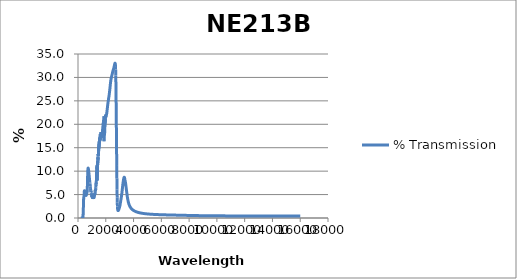
| Category | % Transmission |
|---|---|
| 200.0 | 0 |
| 201.0 | 0 |
| 202.0 | 0 |
| 203.0 | 0 |
| 204.0 | 0 |
| 205.0 | 0 |
| 206.0 | 0 |
| 207.0 | 0 |
| 208.0 | 0 |
| 209.0 | 0 |
| 210.0 | 0 |
| 211.0 | 0 |
| 212.0 | 0 |
| 213.0 | 0 |
| 214.0 | 0 |
| 215.0 | 0 |
| 216.0 | 0 |
| 217.0 | 0 |
| 218.0 | 0 |
| 219.0 | 0 |
| 220.0 | 0 |
| 221.0 | 0 |
| 222.0 | 0 |
| 223.0 | 0 |
| 224.0 | 0 |
| 225.0 | 0 |
| 226.0 | 0 |
| 227.0 | 0 |
| 228.0 | 0 |
| 229.0 | 0 |
| 230.0 | 0 |
| 231.0 | 0 |
| 232.0 | 0 |
| 233.0 | 0 |
| 234.0 | 0 |
| 235.0 | 0 |
| 236.0 | 0 |
| 237.0 | 0 |
| 238.0 | 0 |
| 239.0 | 0 |
| 240.0 | 0 |
| 241.0 | 0 |
| 242.0 | 0 |
| 243.0 | 0 |
| 244.0 | 0 |
| 245.0 | 0 |
| 246.0 | 0 |
| 247.0 | 0 |
| 248.0 | 0 |
| 249.0 | 0 |
| 250.0 | 0 |
| 251.0 | 0 |
| 252.0 | 0 |
| 253.0 | 0 |
| 254.0 | 0 |
| 255.0 | 0 |
| 256.0 | 0 |
| 257.0 | 0 |
| 258.0 | 0 |
| 259.0 | 0 |
| 260.0 | 0 |
| 261.0 | 0 |
| 262.0 | 0 |
| 263.0 | 0 |
| 264.0 | 0 |
| 265.0 | 0 |
| 266.0 | 0 |
| 267.0 | 0 |
| 268.0 | 0 |
| 269.0 | 0 |
| 270.0 | 0 |
| 271.0 | 0 |
| 272.0 | 0 |
| 273.0 | 0 |
| 274.0 | 0 |
| 275.0 | 0 |
| 276.0 | 0 |
| 277.0 | 0 |
| 278.0 | 0 |
| 279.0 | 0 |
| 280.0 | 0 |
| 281.0 | 0 |
| 282.0 | 0 |
| 283.0 | 0 |
| 284.0 | 0 |
| 285.0 | 0 |
| 286.0 | 0 |
| 287.0 | 0 |
| 288.0 | 0 |
| 289.0 | 0 |
| 290.0 | 0 |
| 291.0 | 0 |
| 292.0 | 0 |
| 293.0 | 0 |
| 294.0 | 0 |
| 295.0 | 0 |
| 296.0 | 0 |
| 297.0 | 0 |
| 298.0 | 0 |
| 299.0 | 0 |
| 300.0 | 0 |
| 301.0 | 0 |
| 302.0 | 0 |
| 303.0 | 0 |
| 304.0 | 0 |
| 305.0 | 0 |
| 306.0 | 0 |
| 307.0 | 0 |
| 308.0 | 0 |
| 309.0 | 0 |
| 310.0 | 0 |
| 311.0 | 0 |
| 312.0 | 0 |
| 313.0 | 0 |
| 314.0 | 0 |
| 315.0 | 0 |
| 316.0 | 0 |
| 317.0 | 0 |
| 318.0 | 0 |
| 319.0 | 0 |
| 320.0 | 0 |
| 321.0 | 0 |
| 322.0 | 0 |
| 323.0 | 0 |
| 324.0 | 0 |
| 325.0 | 0 |
| 326.0 | 0 |
| 327.0 | 0 |
| 328.0 | 0 |
| 329.0 | 0 |
| 330.0 | 0 |
| 331.0 | 0 |
| 332.0 | 0 |
| 333.0 | 0 |
| 334.0 | 0 |
| 335.0 | 0 |
| 336.0 | 0 |
| 337.0 | 0 |
| 338.0 | 0 |
| 339.0 | 0.001 |
| 340.0 | 0.001 |
| 341.0 | 0.002 |
| 342.0 | 0.003 |
| 343.0 | 0.004 |
| 344.0 | 0.006 |
| 345.0 | 0.009 |
| 346.0 | 0.013 |
| 347.0 | 0.018 |
| 348.0 | 0.024 |
| 349.0 | 0.033 |
| 350.0 | 0.043 |
| 351.0 | 0.056 |
| 352.0 | 0.071 |
| 353.0 | 0.09 |
| 354.0 | 0.112 |
| 355.0 | 0.138 |
| 356.0 | 0.168 |
| 357.0 | 0.203 |
| 358.0 | 0.243 |
| 359.0 | 0.288 |
| 360.0 | 0.338 |
| 361.0 | 0.392 |
| 362.0 | 0.448 |
| 363.0 | 0.507 |
| 364.0 | 0.567 |
| 365.0 | 0.63 |
| 366.0 | 0.691 |
| 367.0 | 0.748 |
| 368.0 | 0.793 |
| 369.0 | 0.824 |
| 370.0 | 0.836 |
| 371.0 | 0.832 |
| 372.0 | 0.813 |
| 373.0 | 0.785 |
| 374.0 | 0.756 |
| 375.0 | 0.736 |
| 376.0 | 0.735 |
| 377.0 | 0.759 |
| 378.0 | 0.811 |
| 379.0 | 0.891 |
| 380.0 | 0.999 |
| 381.0 | 1.129 |
| 382.0 | 1.278 |
| 383.0 | 1.441 |
| 384.0 | 1.615 |
| 385.0 | 1.797 |
| 386.0 | 1.985 |
| 387.0 | 2.177 |
| 388.0 | 2.368 |
| 389.0 | 2.551 |
| 390.0 | 2.724 |
| 391.0 | 2.887 |
| 392.0 | 3.044 |
| 393.0 | 3.195 |
| 394.0 | 3.336 |
| 395.0 | 3.462 |
| 396.0 | 3.575 |
| 397.0 | 3.679 |
| 398.0 | 3.774 |
| 399.0 | 3.857 |
| 400.0 | 3.925 |
| 401.0 | 3.977 |
| 402.0 | 4.013 |
| 403.0 | 4.036 |
| 404.0 | 4.05 |
| 405.0 | 4.062 |
| 406.0 | 4.069 |
| 407.0 | 4.07 |
| 408.0 | 4.065 |
| 409.0 | 4.061 |
| 410.0 | 4.065 |
| 411.0 | 4.078 |
| 412.0 | 4.095 |
| 413.0 | 4.113 |
| 414.0 | 4.13 |
| 415.0 | 4.152 |
| 416.0 | 4.184 |
| 417.0 | 4.226 |
| 418.0 | 4.27 |
| 419.0 | 4.314 |
| 420.0 | 4.356 |
| 421.0 | 4.399 |
| 422.0 | 4.449 |
| 423.0 | 4.504 |
| 424.0 | 4.556 |
| 425.0 | 4.599 |
| 426.0 | 4.632 |
| 427.0 | 4.661 |
| 428.0 | 4.691 |
| 429.0 | 4.719 |
| 430.0 | 4.738 |
| 431.0 | 4.744 |
| 432.0 | 4.737 |
| 433.0 | 4.725 |
| 434.0 | 4.715 |
| 435.0 | 4.707 |
| 436.0 | 4.699 |
| 437.0 | 4.689 |
| 438.0 | 4.681 |
| 439.0 | 4.683 |
| 440.0 | 4.7 |
| 441.0 | 4.732 |
| 442.0 | 4.773 |
| 443.0 | 4.818 |
| 444.0 | 4.869 |
| 445.0 | 4.928 |
| 446.0 | 4.999 |
| 447.0 | 5.078 |
| 448.0 | 5.157 |
| 449.0 | 5.23 |
| 450.0 | 5.295 |
| 451.0 | 5.359 |
| 452.0 | 5.426 |
| 453.0 | 5.494 |
| 454.0 | 5.557 |
| 455.0 | 5.61 |
| 456.0 | 5.655 |
| 457.0 | 5.696 |
| 458.0 | 5.738 |
| 459.0 | 5.777 |
| 460.0 | 5.806 |
| 461.0 | 5.82 |
| 462.0 | 5.82 |
| 463.0 | 5.817 |
| 464.0 | 5.816 |
| 465.0 | 5.815 |
| 466.0 | 5.807 |
| 467.0 | 5.789 |
| 468.0 | 5.763 |
| 469.0 | 5.736 |
| 470.0 | 5.713 |
| 471.0 | 5.693 |
| 472.0 | 5.67 |
| 473.0 | 5.642 |
| 474.0 | 5.612 |
| 475.0 | 5.584 |
| 476.0 | 5.562 |
| 477.0 | 5.541 |
| 478.0 | 5.515 |
| 479.0 | 5.48 |
| 480.0 | 5.441 |
| 481.0 | 5.408 |
| 482.0 | 5.384 |
| 483.0 | 5.366 |
| 484.0 | 5.347 |
| 485.0 | 5.324 |
| 486.0 | 5.297 |
| 487.0 | 5.27 |
| 488.0 | 5.244 |
| 489.0 | 5.221 |
| 490.0 | 5.199 |
| 491.0 | 5.178 |
| 492.0 | 5.156 |
| 493.0 | 5.14 |
| 494.0 | 5.131 |
| 495.0 | 5.125 |
| 496.0 | 5.115 |
| 497.0 | 5.099 |
| 498.0 | 5.08 |
| 499.0 | 5.064 |
| 500.0 | 5.055 |
| 501.0 | 5.052 |
| 502.0 | 5.048 |
| 503.0 | 5.04 |
| 504.0 | 5.029 |
| 505.0 | 5.023 |
| 506.0 | 5.024 |
| 507.0 | 5.032 |
| 508.0 | 5.04 |
| 509.0 | 5.044 |
| 510.0 | 5.044 |
| 511.0 | 5.045 |
| 512.0 | 5.052 |
| 513.0 | 5.065 |
| 514.0 | 5.079 |
| 515.0 | 5.089 |
| 516.0 | 5.097 |
| 517.0 | 5.109 |
| 518.0 | 5.129 |
| 519.0 | 5.154 |
| 520.0 | 5.178 |
| 521.0 | 5.197 |
| 522.0 | 5.212 |
| 523.0 | 5.233 |
| 524.0 | 5.26 |
| 525.0 | 5.289 |
| 526.0 | 5.316 |
| 527.0 | 5.339 |
| 528.0 | 5.365 |
| 529.0 | 5.395 |
| 530.0 | 5.431 |
| 531.0 | 5.468 |
| 532.0 | 5.501 |
| 533.0 | 5.53 |
| 534.0 | 5.554 |
| 535.0 | 5.576 |
| 536.0 | 5.6 |
| 537.0 | 5.623 |
| 538.0 | 5.646 |
| 539.0 | 5.668 |
| 540.0 | 5.685 |
| 541.0 | 5.698 |
| 542.0 | 5.71 |
| 543.0 | 5.723 |
| 544.0 | 5.739 |
| 545.0 | 5.752 |
| 546.0 | 5.76 |
| 547.0 | 5.761 |
| 548.0 | 5.758 |
| 549.0 | 5.757 |
| 550.0 | 5.759 |
| 551.0 | 5.759 |
| 552.0 | 5.752 |
| 553.0 | 5.734 |
| 554.0 | 5.713 |
| 555.0 | 5.696 |
| 556.0 | 5.684 |
| 557.0 | 5.667 |
| 558.0 | 5.645 |
| 559.0 | 5.618 |
| 560.0 | 5.594 |
| 561.0 | 5.57 |
| 562.0 | 5.544 |
| 563.0 | 5.516 |
| 564.0 | 5.487 |
| 565.0 | 5.459 |
| 566.0 | 5.429 |
| 567.0 | 5.396 |
| 568.0 | 5.362 |
| 569.0 | 5.329 |
| 570.0 | 5.297 |
| 571.0 | 5.264 |
| 572.0 | 5.228 |
| 573.0 | 5.191 |
| 574.0 | 5.157 |
| 575.0 | 5.125 |
| 576.0 | 5.093 |
| 577.0 | 5.058 |
| 578.0 | 5.024 |
| 579.0 | 4.993 |
| 580.0 | 4.967 |
| 581.0 | 4.942 |
| 582.0 | 4.916 |
| 583.0 | 4.892 |
| 584.0 | 4.872 |
| 585.0 | 4.857 |
| 586.0 | 4.846 |
| 587.0 | 4.838 |
| 588.0 | 4.83 |
| 589.0 | 4.822 |
| 590.0 | 4.818 |
| 591.0 | 4.818 |
| 592.0 | 4.821 |
| 593.0 | 4.823 |
| 594.0 | 4.825 |
| 595.0 | 4.833 |
| 596.0 | 4.848 |
| 597.0 | 4.866 |
| 598.0 | 4.885 |
| 599.0 | 4.901 |
| 600.0 | 4.916 |
| 601.0 | 4.928 |
| 602.0 | 4.942 |
| 603.0 | 4.959 |
| 604.0 | 4.98 |
| 605.0 | 5.002 |
| 606.0 | 5.023 |
| 607.0 | 5.042 |
| 608.0 | 5.06 |
| 609.0 | 5.078 |
| 610.0 | 5.101 |
| 611.0 | 5.124 |
| 612.0 | 5.148 |
| 613.0 | 5.169 |
| 614.0 | 5.188 |
| 615.0 | 5.207 |
| 616.0 | 5.229 |
| 617.0 | 5.249 |
| 618.0 | 5.265 |
| 619.0 | 5.277 |
| 620.0 | 5.286 |
| 621.0 | 5.296 |
| 622.0 | 5.309 |
| 623.0 | 5.325 |
| 624.0 | 5.341 |
| 625.0 | 5.352 |
| 626.0 | 5.354 |
| 627.0 | 5.354 |
| 628.0 | 5.353 |
| 629.0 | 5.357 |
| 630.0 | 5.36 |
| 631.0 | 5.36 |
| 632.0 | 5.353 |
| 633.0 | 5.344 |
| 634.0 | 5.339 |
| 635.0 | 5.34 |
| 636.0 | 5.341 |
| 637.0 | 5.336 |
| 638.0 | 5.332 |
| 639.0 | 5.329 |
| 640.0 | 5.332 |
| 641.0 | 5.337 |
| 642.0 | 5.343 |
| 643.0 | 5.347 |
| 644.0 | 5.351 |
| 645.0 | 5.355 |
| 646.0 | 5.36 |
| 647.0 | 5.367 |
| 648.0 | 5.376 |
| 649.0 | 5.388 |
| 650.0 | 5.402 |
| 651.0 | 5.414 |
| 652.0 | 5.427 |
| 653.0 | 5.448 |
| 654.0 | 5.476 |
| 655.0 | 5.504 |
| 656.0 | 5.526 |
| 657.0 | 5.55 |
| 658.0 | 5.584 |
| 659.0 | 5.628 |
| 660.0 | 5.677 |
| 661.0 | 5.725 |
| 662.0 | 5.77 |
| 663.0 | 5.818 |
| 664.0 | 5.875 |
| 665.0 | 5.937 |
| 666.0 | 6.006 |
| 667.0 | 6.073 |
| 668.0 | 6.146 |
| 669.0 | 6.219 |
| 670.0 | 6.302 |
| 671.0 | 6.389 |
| 672.0 | 6.483 |
| 673.0 | 6.577 |
| 674.0 | 6.675 |
| 675.0 | 6.778 |
| 676.0 | 6.888 |
| 677.0 | 7.006 |
| 678.0 | 7.128 |
| 679.0 | 7.246 |
| 680.0 | 7.358 |
| 681.0 | 7.468 |
| 682.0 | 7.589 |
| 683.0 | 7.713 |
| 684.0 | 7.842 |
| 685.0 | 7.962 |
| 686.0 | 8.085 |
| 687.0 | 8.205 |
| 688.0 | 8.334 |
| 689.0 | 8.463 |
| 690.0 | 8.588 |
| 691.0 | 8.703 |
| 692.0 | 8.811 |
| 693.0 | 8.915 |
| 694.0 | 9.017 |
| 695.0 | 9.115 |
| 696.0 | 9.211 |
| 697.0 | 9.305 |
| 698.0 | 9.401 |
| 699.0 | 9.492 |
| 700.0 | 9.583 |
| 701.0 | 9.666 |
| 702.0 | 9.749 |
| 703.0 | 9.82 |
| 704.0 | 9.884 |
| 705.0 | 9.946 |
| 706.0 | 10.009 |
| 707.0 | 10.077 |
| 708.0 | 10.137 |
| 709.0 | 10.186 |
| 710.0 | 10.223 |
| 711.0 | 10.261 |
| 712.0 | 10.305 |
| 713.0 | 10.352 |
| 714.0 | 10.393 |
| 715.0 | 10.43 |
| 716.0 | 10.455 |
| 717.0 | 10.483 |
| 718.0 | 10.505 |
| 719.0 | 10.538 |
| 720.0 | 10.558 |
| 721.0 | 10.576 |
| 722.0 | 10.584 |
| 723.0 | 10.595 |
| 724.0 | 10.61 |
| 725.0 | 10.623 |
| 726.0 | 10.631 |
| 727.0 | 10.637 |
| 728.0 | 10.638 |
| 729.0 | 10.645 |
| 730.0 | 10.649 |
| 731.0 | 10.656 |
| 732.0 | 10.655 |
| 733.0 | 10.647 |
| 734.0 | 10.638 |
| 735.0 | 10.633 |
| 736.0 | 10.629 |
| 737.0 | 10.622 |
| 738.0 | 10.61 |
| 739.0 | 10.595 |
| 740.0 | 10.582 |
| 741.0 | 10.57 |
| 742.0 | 10.565 |
| 743.0 | 10.552 |
| 744.0 | 10.539 |
| 745.0 | 10.514 |
| 746.0 | 10.497 |
| 747.0 | 10.481 |
| 748.0 | 10.475 |
| 749.0 | 10.462 |
| 750.0 | 10.447 |
| 751.0 | 10.429 |
| 752.0 | 10.413 |
| 753.0 | 10.399 |
| 754.0 | 10.386 |
| 755.0 | 10.368 |
| 756.0 | 10.343 |
| 757.0 | 10.312 |
| 758.0 | 10.285 |
| 759.0 | 10.262 |
| 760.0 | 10.244 |
| 761.0 | 10.219 |
| 762.0 | 10.193 |
| 763.0 | 10.168 |
| 764.0 | 10.148 |
| 765.0 | 10.13 |
| 766.0 | 10.11 |
| 767.0 | 10.083 |
| 768.0 | 10.055 |
| 769.0 | 10.022 |
| 770.0 | 9.991 |
| 771.0 | 9.961 |
| 772.0 | 9.935 |
| 773.0 | 9.911 |
| 774.0 | 9.887 |
| 775.0 | 9.86 |
| 776.0 | 9.836 |
| 777.0 | 9.81 |
| 778.0 | 9.785 |
| 779.0 | 9.759 |
| 780.0 | 9.733 |
| 781.0 | 9.702 |
| 782.0 | 9.666 |
| 783.0 | 9.631 |
| 784.0 | 9.601 |
| 785.0 | 9.571 |
| 786.0 | 9.541 |
| 787.0 | 9.514 |
| 788.0 | 9.491 |
| 789.0 | 9.467 |
| 790.0 | 9.439 |
| 791.0 | 9.411 |
| 792.0 | 9.381 |
| 793.0 | 9.351 |
| 794.0 | 9.318 |
| 795.0 | 9.288 |
| 796.0 | 9.259 |
| 797.0 | 9.23 |
| 798.0 | 9.203 |
| 799.0 | 9.172 |
| 800.0 | 9.139 |
| 801.0 | 9.1 |
| 802.0 | 9.063 |
| 803.0 | 9.03 |
| 804.0 | 9.006 |
| 805.0 | 8.979 |
| 806.0 | 8.948 |
| 807.0 | 8.912 |
| 808.0 | 8.882 |
| 809.0 | 8.857 |
| 810.0 | 8.838 |
| 811.0 | 8.813 |
| 812.0 | 8.781 |
| 813.0 | 8.748 |
| 814.0 | 8.716 |
| 815.0 | 8.685 |
| 816.0 | 8.651 |
| 817.0 | 8.624 |
| 818.0 | 8.596 |
| 819.0 | 8.572 |
| 820.0 | 8.538 |
| 821.0 | 8.507 |
| 822.0 | 8.475 |
| 823.0 | 8.452 |
| 824.0 | 8.429 |
| 825.0 | 8.403 |
| 826.0 | 8.369 |
| 827.0 | 8.341 |
| 828.0 | 8.315 |
| 829.0 | 8.292 |
| 830.0 | 8.263 |
| 831.0 | 8.233 |
| 832.0 | 8.203 |
| 833.0 | 8.174 |
| 834.0 | 8.146 |
| 835.0 | 8.117 |
| 836.0 | 8.087 |
| 837.0 | 8.059 |
| 838.0 | 8.033 |
| 839.0 | 8.01 |
| 840.0 | 7.984 |
| 841.0 | 7.957 |
| 842.0 | 7.93 |
| 843.0 | 7.905 |
| 844.0 | 7.875 |
| 845.0 | 7.835 |
| 846.0 | 7.793 |
| 847.0 | 7.764 |
| 848.0 | 7.751 |
| 849.0 | 7.741 |
| 850.0 | 7.724 |
| 851.0 | 7.697 |
| 852.0 | 7.664 |
| 853.0 | 7.631 |
| 854.0 | 7.6 |
| 855.0 | 7.575 |
| 856.0 | 7.552 |
| 857.0 | 7.517 |
| 858.0 | 7.449 |
| 859.0 | 7.333 |
| 860.0 | 7.188 |
| 861.0 | 7.061 |
| 862.0 | 7.001 |
| 863.0 | 7.014 |
| 864.0 | 7.075 |
| 865.0 | 7.119 |
| 866.0 | 7.098 |
| 867.0 | 7.005 |
| 868.0 | 6.893 |
| 869.0 | 6.809 |
| 870.0 | 6.769 |
| 871.0 | 6.767 |
| 872.0 | 6.788 |
| 873.0 | 6.816 |
| 874.0 | 6.824 |
| 875.0 | 6.802 |
| 876.0 | 6.751 |
| 877.0 | 6.69 |
| 878.0 | 6.653 |
| 879.0 | 6.654 |
| 880.0 | 6.686 |
| 881.0 | 6.7 |
| 882.0 | 6.664 |
| 883.0 | 6.585 |
| 884.0 | 6.524 |
| 885.0 | 6.527 |
| 886.0 | 6.568 |
| 887.0 | 6.578 |
| 888.0 | 6.52 |
| 889.0 | 6.439 |
| 890.0 | 6.4 |
| 891.0 | 6.423 |
| 892.0 | 6.477 |
| 893.0 | 6.502 |
| 894.0 | 6.47 |
| 895.0 | 6.395 |
| 896.0 | 6.33 |
| 897.0 | 6.319 |
| 898.0 | 6.351 |
| 899.0 | 6.374 |
| 900.0 | 6.339 |
| 901.0 | 6.256 |
| 902.0 | 6.194 |
| 903.0 | 6.201 |
| 904.0 | 6.246 |
| 905.0 | 6.262 |
| 906.0 | 6.23 |
| 907.0 | 6.183 |
| 908.0 | 6.141 |
| 909.0 | 6.09 |
| 910.0 | 6.038 |
| 911.0 | 6.007 |
| 912.0 | 5.994 |
| 913.0 | 5.967 |
| 914.0 | 5.93 |
| 915.0 | 5.919 |
| 916.0 | 5.955 |
| 917.0 | 6.007 |
| 918.0 | 6.012 |
| 919.0 | 5.954 |
| 920.0 | 5.876 |
| 921.0 | 5.842 |
| 922.0 | 5.857 |
| 923.0 | 5.858 |
| 924.0 | 5.803 |
| 925.0 | 5.729 |
| 926.0 | 5.708 |
| 927.0 | 5.742 |
| 928.0 | 5.76 |
| 929.0 | 5.7 |
| 930.0 | 5.59 |
| 931.0 | 5.518 |
| 932.0 | 5.538 |
| 933.0 | 5.609 |
| 934.0 | 5.65 |
| 935.0 | 5.619 |
| 936.0 | 5.561 |
| 937.0 | 5.528 |
| 938.0 | 5.53 |
| 939.0 | 5.531 |
| 940.0 | 5.503 |
| 941.0 | 5.451 |
| 942.0 | 5.407 |
| 943.0 | 5.396 |
| 944.0 | 5.414 |
| 945.0 | 5.428 |
| 946.0 | 5.41 |
| 947.0 | 5.362 |
| 948.0 | 5.322 |
| 949.0 | 5.311 |
| 950.0 | 5.309 |
| 951.0 | 5.287 |
| 952.0 | 5.247 |
| 953.0 | 5.224 |
| 954.0 | 5.224 |
| 955.0 | 5.238 |
| 956.0 | 5.239 |
| 957.0 | 5.22 |
| 958.0 | 5.185 |
| 959.0 | 5.153 |
| 960.0 | 5.149 |
| 961.0 | 5.161 |
| 962.0 | 5.171 |
| 963.0 | 5.165 |
| 964.0 | 5.151 |
| 965.0 | 5.134 |
| 966.0 | 5.095 |
| 967.0 | 5.041 |
| 968.0 | 4.997 |
| 969.0 | 4.999 |
| 970.0 | 5.03 |
| 971.0 | 5.057 |
| 972.0 | 5.051 |
| 973.0 | 5.028 |
| 974.0 | 5.008 |
| 975.0 | 4.995 |
| 976.0 | 4.982 |
| 977.0 | 4.967 |
| 978.0 | 4.949 |
| 979.0 | 4.915 |
| 980.0 | 4.874 |
| 981.0 | 4.844 |
| 982.0 | 4.841 |
| 983.0 | 4.861 |
| 984.0 | 4.895 |
| 985.0 | 4.929 |
| 986.0 | 4.924 |
| 987.0 | 4.873 |
| 988.0 | 4.815 |
| 989.0 | 4.789 |
| 990.0 | 4.794 |
| 991.0 | 4.776 |
| 992.0 | 4.727 |
| 993.0 | 4.68 |
| 994.0 | 4.67 |
| 995.0 | 4.699 |
| 996.0 | 4.719 |
| 997.0 | 4.731 |
| 998.0 | 4.734 |
| 999.0 | 4.739 |
| 1000.0 | 4.715 |
| 1001.0 | 4.667 |
| 1002.0 | 4.636 |
| 1003.0 | 4.647 |
| 1004.0 | 4.691 |
| 1005.0 | 4.705 |
| 1006.0 | 4.674 |
| 1007.0 | 4.614 |
| 1008.0 | 4.582 |
| 1009.0 | 4.589 |
| 1010.0 | 4.62 |
| 1011.0 | 4.633 |
| 1012.0 | 4.61 |
| 1013.0 | 4.56 |
| 1014.0 | 4.529 |
| 1015.0 | 4.539 |
| 1016.0 | 4.575 |
| 1017.0 | 4.594 |
| 1018.0 | 4.564 |
| 1019.0 | 4.51 |
| 1020.0 | 4.475 |
| 1021.0 | 4.485 |
| 1022.0 | 4.521 |
| 1023.0 | 4.537 |
| 1024.0 | 4.52 |
| 1025.0 | 4.481 |
| 1026.0 | 4.468 |
| 1027.0 | 4.483 |
| 1028.0 | 4.515 |
| 1029.0 | 4.523 |
| 1030.0 | 4.496 |
| 1031.0 | 4.441 |
| 1032.0 | 4.38 |
| 1033.0 | 4.351 |
| 1034.0 | 4.362 |
| 1035.0 | 4.407 |
| 1036.0 | 4.434 |
| 1037.0 | 4.425 |
| 1038.0 | 4.386 |
| 1039.0 | 4.361 |
| 1040.0 | 4.369 |
| 1041.0 | 4.404 |
| 1042.0 | 4.424 |
| 1043.0 | 4.414 |
| 1044.0 | 4.381 |
| 1045.0 | 4.336 |
| 1046.0 | 4.296 |
| 1047.0 | 4.281 |
| 1048.0 | 4.307 |
| 1049.0 | 4.364 |
| 1050.0 | 4.399 |
| 1051.0 | 4.396 |
| 1052.0 | 4.357 |
| 1053.0 | 4.311 |
| 1054.0 | 4.267 |
| 1055.0 | 4.263 |
| 1056.0 | 4.295 |
| 1057.0 | 4.362 |
| 1058.0 | 4.403 |
| 1059.0 | 4.412 |
| 1060.0 | 4.386 |
| 1061.0 | 4.352 |
| 1062.0 | 4.313 |
| 1063.0 | 4.27 |
| 1064.0 | 4.218 |
| 1065.0 | 4.174 |
| 1066.0 | 4.173 |
| 1067.0 | 4.224 |
| 1068.0 | 4.301 |
| 1069.0 | 4.351 |
| 1070.0 | 4.365 |
| 1071.0 | 4.352 |
| 1072.0 | 4.325 |
| 1073.0 | 4.279 |
| 1074.0 | 4.227 |
| 1075.0 | 4.211 |
| 1076.0 | 4.243 |
| 1077.0 | 4.307 |
| 1078.0 | 4.336 |
| 1079.0 | 4.321 |
| 1080.0 | 4.272 |
| 1081.0 | 4.225 |
| 1082.0 | 4.211 |
| 1083.0 | 4.234 |
| 1084.0 | 4.286 |
| 1085.0 | 4.319 |
| 1086.0 | 4.319 |
| 1087.0 | 4.29 |
| 1088.0 | 4.252 |
| 1089.0 | 4.216 |
| 1090.0 | 4.216 |
| 1091.0 | 4.254 |
| 1092.0 | 4.324 |
| 1093.0 | 4.359 |
| 1094.0 | 4.357 |
| 1095.0 | 4.313 |
| 1096.0 | 4.266 |
| 1097.0 | 4.219 |
| 1098.0 | 4.192 |
| 1099.0 | 4.204 |
| 1100.0 | 4.257 |
| 1101.0 | 4.335 |
| 1102.0 | 4.388 |
| 1103.0 | 4.413 |
| 1104.0 | 4.403 |
| 1105.0 | 4.385 |
| 1106.0 | 4.363 |
| 1107.0 | 4.348 |
| 1108.0 | 4.332 |
| 1109.0 | 4.314 |
| 1110.0 | 4.288 |
| 1111.0 | 4.265 |
| 1112.0 | 4.245 |
| 1113.0 | 4.231 |
| 1114.0 | 4.219 |
| 1115.0 | 4.196 |
| 1116.0 | 4.164 |
| 1117.0 | 4.127 |
| 1118.0 | 4.109 |
| 1119.0 | 4.141 |
| 1120.0 | 4.219 |
| 1121.0 | 4.302 |
| 1122.0 | 4.333 |
| 1123.0 | 4.33 |
| 1124.0 | 4.344 |
| 1125.0 | 4.402 |
| 1126.0 | 4.475 |
| 1127.0 | 4.485 |
| 1128.0 | 4.403 |
| 1129.0 | 4.265 |
| 1130.0 | 4.162 |
| 1131.0 | 4.179 |
| 1132.0 | 4.269 |
| 1133.0 | 4.342 |
| 1134.0 | 4.315 |
| 1135.0 | 4.274 |
| 1136.0 | 4.277 |
| 1137.0 | 4.353 |
| 1138.0 | 4.41 |
| 1139.0 | 4.437 |
| 1140.0 | 4.433 |
| 1141.0 | 4.438 |
| 1142.0 | 4.45 |
| 1143.0 | 4.454 |
| 1144.0 | 4.446 |
| 1145.0 | 4.421 |
| 1146.0 | 4.398 |
| 1147.0 | 4.4 |
| 1148.0 | 4.44 |
| 1149.0 | 4.501 |
| 1150.0 | 4.543 |
| 1151.0 | 4.555 |
| 1152.0 | 4.54 |
| 1153.0 | 4.524 |
| 1154.0 | 4.508 |
| 1155.0 | 4.491 |
| 1156.0 | 4.471 |
| 1157.0 | 4.447 |
| 1158.0 | 4.421 |
| 1159.0 | 4.404 |
| 1160.0 | 4.421 |
| 1161.0 | 4.484 |
| 1162.0 | 4.569 |
| 1163.0 | 4.633 |
| 1164.0 | 4.656 |
| 1165.0 | 4.662 |
| 1166.0 | 4.665 |
| 1167.0 | 4.678 |
| 1168.0 | 4.688 |
| 1169.0 | 4.696 |
| 1170.0 | 4.699 |
| 1171.0 | 4.705 |
| 1172.0 | 4.714 |
| 1173.0 | 4.725 |
| 1174.0 | 4.735 |
| 1175.0 | 4.748 |
| 1176.0 | 4.766 |
| 1177.0 | 4.783 |
| 1178.0 | 4.79 |
| 1179.0 | 4.773 |
| 1180.0 | 4.746 |
| 1181.0 | 4.712 |
| 1182.0 | 4.703 |
| 1183.0 | 4.746 |
| 1184.0 | 4.867 |
| 1185.0 | 5.053 |
| 1186.0 | 5.225 |
| 1187.0 | 5.272 |
| 1188.0 | 5.162 |
| 1189.0 | 4.961 |
| 1190.0 | 4.82 |
| 1191.0 | 4.762 |
| 1192.0 | 4.768 |
| 1193.0 | 4.774 |
| 1194.0 | 4.809 |
| 1195.0 | 4.869 |
| 1196.0 | 4.936 |
| 1197.0 | 4.955 |
| 1198.0 | 4.94 |
| 1199.0 | 4.931 |
| 1200.0 | 4.957 |
| 1201.0 | 4.998 |
| 1202.0 | 5.013 |
| 1203.0 | 5.032 |
| 1204.0 | 5.073 |
| 1205.0 | 5.137 |
| 1206.0 | 5.171 |
| 1207.0 | 5.167 |
| 1208.0 | 5.143 |
| 1209.0 | 5.13 |
| 1210.0 | 5.134 |
| 1211.0 | 5.152 |
| 1212.0 | 5.182 |
| 1213.0 | 5.222 |
| 1214.0 | 5.243 |
| 1215.0 | 5.227 |
| 1216.0 | 5.175 |
| 1217.0 | 5.13 |
| 1218.0 | 5.133 |
| 1219.0 | 5.18 |
| 1220.0 | 5.234 |
| 1221.0 | 5.252 |
| 1222.0 | 5.229 |
| 1223.0 | 5.195 |
| 1224.0 | 5.185 |
| 1225.0 | 5.203 |
| 1226.0 | 5.239 |
| 1227.0 | 5.281 |
| 1228.0 | 5.329 |
| 1229.0 | 5.369 |
| 1230.0 | 5.388 |
| 1231.0 | 5.394 |
| 1232.0 | 5.392 |
| 1233.0 | 5.39 |
| 1234.0 | 5.398 |
| 1235.0 | 5.445 |
| 1236.0 | 5.53 |
| 1237.0 | 5.62 |
| 1238.0 | 5.669 |
| 1239.0 | 5.676 |
| 1240.0 | 5.658 |
| 1241.0 | 5.642 |
| 1242.0 | 5.648 |
| 1243.0 | 5.706 |
| 1244.0 | 5.817 |
| 1245.0 | 5.942 |
| 1246.0 | 6.005 |
| 1247.0 | 5.973 |
| 1248.0 | 5.867 |
| 1249.0 | 5.764 |
| 1250.0 | 5.726 |
| 1251.0 | 5.754 |
| 1252.0 | 5.821 |
| 1253.0 | 5.889 |
| 1254.0 | 5.936 |
| 1255.0 | 5.948 |
| 1256.0 | 5.937 |
| 1257.0 | 5.939 |
| 1258.0 | 5.974 |
| 1259.0 | 6.014 |
| 1260.0 | 6.019 |
| 1261.0 | 5.989 |
| 1262.0 | 5.973 |
| 1263.0 | 6.009 |
| 1264.0 | 6.091 |
| 1265.0 | 6.18 |
| 1266.0 | 6.229 |
| 1267.0 | 6.21 |
| 1268.0 | 6.133 |
| 1269.0 | 6.051 |
| 1270.0 | 6.016 |
| 1271.0 | 6.05 |
| 1272.0 | 6.148 |
| 1273.0 | 6.285 |
| 1274.0 | 6.417 |
| 1275.0 | 6.502 |
| 1276.0 | 6.538 |
| 1277.0 | 6.539 |
| 1278.0 | 6.528 |
| 1279.0 | 6.51 |
| 1280.0 | 6.512 |
| 1281.0 | 6.557 |
| 1282.0 | 6.644 |
| 1283.0 | 6.734 |
| 1284.0 | 6.791 |
| 1285.0 | 6.823 |
| 1286.0 | 6.843 |
| 1287.0 | 6.86 |
| 1288.0 | 6.867 |
| 1289.0 | 6.868 |
| 1290.0 | 6.873 |
| 1291.0 | 6.891 |
| 1292.0 | 6.932 |
| 1293.0 | 6.997 |
| 1294.0 | 7.077 |
| 1295.0 | 7.143 |
| 1296.0 | 7.156 |
| 1297.0 | 7.106 |
| 1298.0 | 7.026 |
| 1299.0 | 6.984 |
| 1300.0 | 7.014 |
| 1301.0 | 7.1 |
| 1302.0 | 7.204 |
| 1303.0 | 7.311 |
| 1304.0 | 7.426 |
| 1305.0 | 7.508 |
| 1306.0 | 7.518 |
| 1307.0 | 7.452 |
| 1308.0 | 7.376 |
| 1309.0 | 7.335 |
| 1310.0 | 7.33 |
| 1311.0 | 7.348 |
| 1312.0 | 7.378 |
| 1313.0 | 7.413 |
| 1314.0 | 7.45 |
| 1315.0 | 7.489 |
| 1316.0 | 7.547 |
| 1317.0 | 7.616 |
| 1318.0 | 7.687 |
| 1319.0 | 7.749 |
| 1320.0 | 7.805 |
| 1321.0 | 7.856 |
| 1322.0 | 7.901 |
| 1323.0 | 7.951 |
| 1324.0 | 8.018 |
| 1325.0 | 8.107 |
| 1326.0 | 8.21 |
| 1327.0 | 8.32 |
| 1328.0 | 8.423 |
| 1329.0 | 8.466 |
| 1330.0 | 8.416 |
| 1331.0 | 8.295 |
| 1332.0 | 8.211 |
| 1333.0 | 8.213 |
| 1334.0 | 8.297 |
| 1335.0 | 8.405 |
| 1336.0 | 8.516 |
| 1337.0 | 8.589 |
| 1338.0 | 8.613 |
| 1339.0 | 8.619 |
| 1340.0 | 8.681 |
| 1341.0 | 8.773 |
| 1342.0 | 8.785 |
| 1343.0 | 8.701 |
| 1344.0 | 8.655 |
| 1345.0 | 8.785 |
| 1346.0 | 9.01 |
| 1347.0 | 9.134 |
| 1348.0 | 9.001 |
| 1349.0 | 8.675 |
| 1350.0 | 8.389 |
| 1351.0 | 8.477 |
| 1352.0 | 9.017 |
| 1353.0 | 9.682 |
| 1354.0 | 9.891 |
| 1355.0 | 9.377 |
| 1356.0 | 8.469 |
| 1357.0 | 7.883 |
| 1358.0 | 8.075 |
| 1359.0 | 8.855 |
| 1360.0 | 9.639 |
| 1361.0 | 9.98 |
| 1362.0 | 9.887 |
| 1363.0 | 9.59 |
| 1364.0 | 9.304 |
| 1365.0 | 9.138 |
| 1366.0 | 9.097 |
| 1367.0 | 9.236 |
| 1368.0 | 9.57 |
| 1369.0 | 10.035 |
| 1370.0 | 10.424 |
| 1371.0 | 10.663 |
| 1372.0 | 10.839 |
| 1373.0 | 11.014 |
| 1374.0 | 10.965 |
| 1375.0 | 10.399 |
| 1376.0 | 9.371 |
| 1377.0 | 8.379 |
| 1378.0 | 8.053 |
| 1379.0 | 8.626 |
| 1380.0 | 9.718 |
| 1381.0 | 10.624 |
| 1382.0 | 10.845 |
| 1383.0 | 10.572 |
| 1384.0 | 10.432 |
| 1385.0 | 10.778 |
| 1386.0 | 11.261 |
| 1387.0 | 11.323 |
| 1388.0 | 10.824 |
| 1389.0 | 10.133 |
| 1390.0 | 9.612 |
| 1391.0 | 9.611 |
| 1392.0 | 10.261 |
| 1393.0 | 11.071 |
| 1394.0 | 11.235 |
| 1395.0 | 10.472 |
| 1396.0 | 9.856 |
| 1397.0 | 10.24 |
| 1398.0 | 11.29 |
| 1399.0 | 11.855 |
| 1400.0 | 11.512 |
| 1401.0 | 10.947 |
| 1402.0 | 10.647 |
| 1403.0 | 10.599 |
| 1404.0 | 10.58 |
| 1405.0 | 10.803 |
| 1406.0 | 11.387 |
| 1407.0 | 11.945 |
| 1408.0 | 11.97 |
| 1409.0 | 11.447 |
| 1410.0 | 11.014 |
| 1411.0 | 11.013 |
| 1412.0 | 11.308 |
| 1413.0 | 11.402 |
| 1414.0 | 11.326 |
| 1415.0 | 11.29 |
| 1416.0 | 11.465 |
| 1417.0 | 11.622 |
| 1418.0 | 11.626 |
| 1419.0 | 11.582 |
| 1420.0 | 11.716 |
| 1421.0 | 12.045 |
| 1422.0 | 12.26 |
| 1423.0 | 12.206 |
| 1424.0 | 11.959 |
| 1425.0 | 11.795 |
| 1426.0 | 11.764 |
| 1427.0 | 11.82 |
| 1428.0 | 11.919 |
| 1429.0 | 12.049 |
| 1430.0 | 12.166 |
| 1431.0 | 12.226 |
| 1432.0 | 12.273 |
| 1433.0 | 12.368 |
| 1434.0 | 12.544 |
| 1435.0 | 12.72 |
| 1436.0 | 12.764 |
| 1437.0 | 12.638 |
| 1438.0 | 12.43 |
| 1439.0 | 12.32 |
| 1440.0 | 12.351 |
| 1441.0 | 12.551 |
| 1442.0 | 12.836 |
| 1443.0 | 13.086 |
| 1444.0 | 13.069 |
| 1445.0 | 12.853 |
| 1446.0 | 12.646 |
| 1447.0 | 12.707 |
| 1448.0 | 12.921 |
| 1449.0 | 13.114 |
| 1450.0 | 13.194 |
| 1451.0 | 13.252 |
| 1452.0 | 13.378 |
| 1453.0 | 13.55 |
| 1454.0 | 13.626 |
| 1455.0 | 13.563 |
| 1456.0 | 13.431 |
| 1457.0 | 13.423 |
| 1458.0 | 13.516 |
| 1459.0 | 13.574 |
| 1460.0 | 13.525 |
| 1461.0 | 13.448 |
| 1462.0 | 13.502 |
| 1463.0 | 13.611 |
| 1464.0 | 13.621 |
| 1465.0 | 13.455 |
| 1466.0 | 13.238 |
| 1467.0 | 13.305 |
| 1468.0 | 13.66 |
| 1469.0 | 14.205 |
| 1470.0 | 14.525 |
| 1471.0 | 14.493 |
| 1472.0 | 14.161 |
| 1473.0 | 13.778 |
| 1474.0 | 13.588 |
| 1475.0 | 13.578 |
| 1476.0 | 13.812 |
| 1477.0 | 14.189 |
| 1478.0 | 14.693 |
| 1479.0 | 15.009 |
| 1480.0 | 15.025 |
| 1481.0 | 14.751 |
| 1482.0 | 14.434 |
| 1483.0 | 14.271 |
| 1484.0 | 14.243 |
| 1485.0 | 14.288 |
| 1486.0 | 14.304 |
| 1487.0 | 14.332 |
| 1488.0 | 14.373 |
| 1489.0 | 14.425 |
| 1490.0 | 14.489 |
| 1491.0 | 14.569 |
| 1492.0 | 14.71 |
| 1493.0 | 14.877 |
| 1494.0 | 15.08 |
| 1495.0 | 15.22 |
| 1496.0 | 15.213 |
| 1497.0 | 15.034 |
| 1498.0 | 14.797 |
| 1499.0 | 14.682 |
| 1500.0 | 14.737 |
| 1501.0 | 14.903 |
| 1502.0 | 15.132 |
| 1503.0 | 15.32 |
| 1504.0 | 15.379 |
| 1505.0 | 15.252 |
| 1506.0 | 15.092 |
| 1507.0 | 15.077 |
| 1508.0 | 15.229 |
| 1509.0 | 15.445 |
| 1510.0 | 15.623 |
| 1511.0 | 15.64 |
| 1512.0 | 15.529 |
| 1513.0 | 15.342 |
| 1514.0 | 15.293 |
| 1515.0 | 15.399 |
| 1516.0 | 15.621 |
| 1517.0 | 15.811 |
| 1518.0 | 15.839 |
| 1519.0 | 15.712 |
| 1520.0 | 15.525 |
| 1521.0 | 15.449 |
| 1522.0 | 15.512 |
| 1523.0 | 15.679 |
| 1524.0 | 15.898 |
| 1525.0 | 16.088 |
| 1526.0 | 16.126 |
| 1527.0 | 16.004 |
| 1528.0 | 15.808 |
| 1529.0 | 15.72 |
| 1530.0 | 15.724 |
| 1531.0 | 15.811 |
| 1532.0 | 15.942 |
| 1533.0 | 16.108 |
| 1534.0 | 16.291 |
| 1535.0 | 16.403 |
| 1536.0 | 16.38 |
| 1537.0 | 16.223 |
| 1538.0 | 16.029 |
| 1539.0 | 15.959 |
| 1540.0 | 15.997 |
| 1541.0 | 16.114 |
| 1542.0 | 16.23 |
| 1543.0 | 16.382 |
| 1544.0 | 16.528 |
| 1545.0 | 16.608 |
| 1546.0 | 16.535 |
| 1547.0 | 16.339 |
| 1548.0 | 16.123 |
| 1549.0 | 16.037 |
| 1550.0 | 16.123 |
| 1551.0 | 16.345 |
| 1552.0 | 16.622 |
| 1553.0 | 16.814 |
| 1554.0 | 16.823 |
| 1555.0 | 16.619 |
| 1556.0 | 16.382 |
| 1557.0 | 16.286 |
| 1558.0 | 16.38 |
| 1559.0 | 16.582 |
| 1560.0 | 16.823 |
| 1561.0 | 17.026 |
| 1562.0 | 17.088 |
| 1563.0 | 16.965 |
| 1564.0 | 16.782 |
| 1565.0 | 16.744 |
| 1566.0 | 16.871 |
| 1567.0 | 17.008 |
| 1568.0 | 16.957 |
| 1569.0 | 16.752 |
| 1570.0 | 16.549 |
| 1571.0 | 16.554 |
| 1572.0 | 16.712 |
| 1573.0 | 16.946 |
| 1574.0 | 17.076 |
| 1575.0 | 17.031 |
| 1576.0 | 16.837 |
| 1577.0 | 16.613 |
| 1578.0 | 16.541 |
| 1579.0 | 16.628 |
| 1580.0 | 16.839 |
| 1581.0 | 17.071 |
| 1582.0 | 17.26 |
| 1583.0 | 17.346 |
| 1584.0 | 17.274 |
| 1585.0 | 17.098 |
| 1586.0 | 16.901 |
| 1587.0 | 16.802 |
| 1588.0 | 16.783 |
| 1589.0 | 16.82 |
| 1590.0 | 16.869 |
| 1591.0 | 16.937 |
| 1592.0 | 16.999 |
| 1593.0 | 17.039 |
| 1594.0 | 17.076 |
| 1595.0 | 17.131 |
| 1596.0 | 17.202 |
| 1597.0 | 17.257 |
| 1598.0 | 17.3 |
| 1599.0 | 17.369 |
| 1600.0 | 17.481 |
| 1601.0 | 17.619 |
| 1602.0 | 17.749 |
| 1603.0 | 17.849 |
| 1604.0 | 17.882 |
| 1605.0 | 17.763 |
| 1606.0 | 17.503 |
| 1607.0 | 17.198 |
| 1608.0 | 17.023 |
| 1609.0 | 16.987 |
| 1610.0 | 17.042 |
| 1611.0 | 17.113 |
| 1612.0 | 17.19 |
| 1613.0 | 17.262 |
| 1614.0 | 17.317 |
| 1615.0 | 17.352 |
| 1616.0 | 17.393 |
| 1617.0 | 17.456 |
| 1618.0 | 17.573 |
| 1619.0 | 17.729 |
| 1620.0 | 17.845 |
| 1621.0 | 17.81 |
| 1622.0 | 17.617 |
| 1623.0 | 17.385 |
| 1624.0 | 17.265 |
| 1625.0 | 17.273 |
| 1626.0 | 17.397 |
| 1627.0 | 17.571 |
| 1628.0 | 17.703 |
| 1629.0 | 17.667 |
| 1630.0 | 17.472 |
| 1631.0 | 17.277 |
| 1632.0 | 17.235 |
| 1633.0 | 17.361 |
| 1634.0 | 17.57 |
| 1635.0 | 17.723 |
| 1636.0 | 17.722 |
| 1637.0 | 17.569 |
| 1638.0 | 17.409 |
| 1639.0 | 17.384 |
| 1640.0 | 17.498 |
| 1641.0 | 17.623 |
| 1642.0 | 17.629 |
| 1643.0 | 17.501 |
| 1644.0 | 17.348 |
| 1645.0 | 17.297 |
| 1646.0 | 17.374 |
| 1647.0 | 17.533 |
| 1648.0 | 17.694 |
| 1649.0 | 17.762 |
| 1650.0 | 17.675 |
| 1651.0 | 17.486 |
| 1652.0 | 17.348 |
| 1653.0 | 17.358 |
| 1654.0 | 17.472 |
| 1655.0 | 17.628 |
| 1656.0 | 17.79 |
| 1657.0 | 17.961 |
| 1658.0 | 18.129 |
| 1659.0 | 18.278 |
| 1660.0 | 18.356 |
| 1661.0 | 18.29 |
| 1662.0 | 18.075 |
| 1663.0 | 17.852 |
| 1664.0 | 17.799 |
| 1665.0 | 17.969 |
| 1666.0 | 18.212 |
| 1667.0 | 18.286 |
| 1668.0 | 18.086 |
| 1669.0 | 17.716 |
| 1670.0 | 17.4 |
| 1671.0 | 17.256 |
| 1672.0 | 17.284 |
| 1673.0 | 17.405 |
| 1674.0 | 17.58 |
| 1675.0 | 17.761 |
| 1676.0 | 17.863 |
| 1677.0 | 17.806 |
| 1678.0 | 17.583 |
| 1679.0 | 17.359 |
| 1680.0 | 17.258 |
| 1681.0 | 17.305 |
| 1682.0 | 17.41 |
| 1683.0 | 17.529 |
| 1684.0 | 17.682 |
| 1685.0 | 17.857 |
| 1686.0 | 17.942 |
| 1687.0 | 17.857 |
| 1688.0 | 17.639 |
| 1689.0 | 17.468 |
| 1690.0 | 17.443 |
| 1691.0 | 17.534 |
| 1692.0 | 17.648 |
| 1693.0 | 17.737 |
| 1694.0 | 17.818 |
| 1695.0 | 17.878 |
| 1696.0 | 17.851 |
| 1697.0 | 17.692 |
| 1698.0 | 17.44 |
| 1699.0 | 17.256 |
| 1700.0 | 17.214 |
| 1701.0 | 17.297 |
| 1702.0 | 17.378 |
| 1703.0 | 17.417 |
| 1704.0 | 17.431 |
| 1705.0 | 17.479 |
| 1706.0 | 17.563 |
| 1707.0 | 17.658 |
| 1708.0 | 17.762 |
| 1709.0 | 17.894 |
| 1710.0 | 18.051 |
| 1711.0 | 18.124 |
| 1712.0 | 18.033 |
| 1713.0 | 17.786 |
| 1714.0 | 17.545 |
| 1715.0 | 17.41 |
| 1716.0 | 17.392 |
| 1717.0 | 17.434 |
| 1718.0 | 17.508 |
| 1719.0 | 17.605 |
| 1720.0 | 17.678 |
| 1721.0 | 17.72 |
| 1722.0 | 17.756 |
| 1723.0 | 17.835 |
| 1724.0 | 17.97 |
| 1725.0 | 18.112 |
| 1726.0 | 18.133 |
| 1727.0 | 17.991 |
| 1728.0 | 17.732 |
| 1729.0 | 17.541 |
| 1730.0 | 17.453 |
| 1731.0 | 17.444 |
| 1732.0 | 17.444 |
| 1733.0 | 17.448 |
| 1734.0 | 17.466 |
| 1735.0 | 17.508 |
| 1736.0 | 17.579 |
| 1737.0 | 17.681 |
| 1738.0 | 17.785 |
| 1739.0 | 17.9 |
| 1740.0 | 18.01 |
| 1741.0 | 18.147 |
| 1742.0 | 18.264 |
| 1743.0 | 18.255 |
| 1744.0 | 18.065 |
| 1745.0 | 17.748 |
| 1746.0 | 17.508 |
| 1747.0 | 17.404 |
| 1748.0 | 17.437 |
| 1749.0 | 17.516 |
| 1750.0 | 17.602 |
| 1751.0 | 17.672 |
| 1752.0 | 17.735 |
| 1753.0 | 17.808 |
| 1754.0 | 17.88 |
| 1755.0 | 17.971 |
| 1756.0 | 18.077 |
| 1757.0 | 18.228 |
| 1758.0 | 18.353 |
| 1759.0 | 18.357 |
| 1760.0 | 18.185 |
| 1761.0 | 17.872 |
| 1762.0 | 17.627 |
| 1763.0 | 17.508 |
| 1764.0 | 17.522 |
| 1765.0 | 17.545 |
| 1766.0 | 17.566 |
| 1767.0 | 17.572 |
| 1768.0 | 17.55 |
| 1769.0 | 17.488 |
| 1770.0 | 17.426 |
| 1771.0 | 17.401 |
| 1772.0 | 17.401 |
| 1773.0 | 17.38 |
| 1774.0 | 17.409 |
| 1775.0 | 17.538 |
| 1776.0 | 17.784 |
| 1777.0 | 18.043 |
| 1778.0 | 18.285 |
| 1779.0 | 18.488 |
| 1780.0 | 18.584 |
| 1781.0 | 18.546 |
| 1782.0 | 18.472 |
| 1783.0 | 18.455 |
| 1784.0 | 18.495 |
| 1785.0 | 18.442 |
| 1786.0 | 18.302 |
| 1787.0 | 18.16 |
| 1788.0 | 18.112 |
| 1789.0 | 18.18 |
| 1790.0 | 18.283 |
| 1791.0 | 18.419 |
| 1792.0 | 18.612 |
| 1793.0 | 18.845 |
| 1794.0 | 18.955 |
| 1795.0 | 18.748 |
| 1796.0 | 18.336 |
| 1797.0 | 18.06 |
| 1798.0 | 18.123 |
| 1799.0 | 18.336 |
| 1800.0 | 18.377 |
| 1801.0 | 18.24 |
| 1802.0 | 18.166 |
| 1803.0 | 18.372 |
| 1804.0 | 18.702 |
| 1805.0 | 18.857 |
| 1806.0 | 18.676 |
| 1807.0 | 18.333 |
| 1808.0 | 18.033 |
| 1809.0 | 17.953 |
| 1810.0 | 18.059 |
| 1811.0 | 18.534 |
| 1812.0 | 19.183 |
| 1813.0 | 19.573 |
| 1814.0 | 19.037 |
| 1815.0 | 18.269 |
| 1816.0 | 17.661 |
| 1817.0 | 17.684 |
| 1818.0 | 18.607 |
| 1819.0 | 19.264 |
| 1820.0 | 20.348 |
| 1821.0 | 19.881 |
| 1822.0 | 19.18 |
| 1823.0 | 17.831 |
| 1824.0 | 17.154 |
| 1825.0 | 17.189 |
| 1826.0 | 17.839 |
| 1827.0 | 18.957 |
| 1828.0 | 20.014 |
| 1829.0 | 20.394 |
| 1830.0 | 19.708 |
| 1831.0 | 18.55 |
| 1832.0 | 17.62 |
| 1833.0 | 17.287 |
| 1834.0 | 18.054 |
| 1835.0 | 18.855 |
| 1836.0 | 19.633 |
| 1837.0 | 19.633 |
| 1838.0 | 19.633 |
| 1839.0 | 19.633 |
| 1840.0 | 19.633 |
| 1841.0 | 18.788 |
| 1842.0 | 17.944 |
| 1843.0 | 17.1 |
| 1844.0 | 17.543 |
| 1845.0 | 18.746 |
| 1846.0 | 19.95 |
| 1847.0 | 20.71 |
| 1848.0 | 19.888 |
| 1849.0 | 18.729 |
| 1850.0 | 17.914 |
| 1851.0 | 18.356 |
| 1852.0 | 19.228 |
| 1853.0 | 19.381 |
| 1854.0 | 18.65 |
| 1855.0 | 17.751 |
| 1856.0 | 17.63 |
| 1857.0 | 18.693 |
| 1858.0 | 20.499 |
| 1859.0 | 20.923 |
| 1860.0 | 20.611 |
| 1861.0 | 19.953 |
| 1862.0 | 19.643 |
| 1863.0 | 18.907 |
| 1864.0 | 17.851 |
| 1865.0 | 17.505 |
| 1866.0 | 17.04 |
| 1867.0 | 16.66 |
| 1868.0 | 16.36 |
| 1869.0 | 16.882 |
| 1870.0 | 17.634 |
| 1871.0 | 18.549 |
| 1872.0 | 19.432 |
| 1873.0 | 20.32 |
| 1874.0 | 21.172 |
| 1875.0 | 21.703 |
| 1876.0 | 21.457 |
| 1877.0 | 20.449 |
| 1878.0 | 19.312 |
| 1879.0 | 18.808 |
| 1880.0 | 19.086 |
| 1881.0 | 19.769 |
| 1882.0 | 20.327 |
| 1883.0 | 20.473 |
| 1884.0 | 20.1 |
| 1885.0 | 19.341 |
| 1886.0 | 18.5 |
| 1887.0 | 18.141 |
| 1888.0 | 18.62 |
| 1889.0 | 19.874 |
| 1890.0 | 20.322 |
| 1891.0 | 20.958 |
| 1892.0 | 20.366 |
| 1893.0 | 19.804 |
| 1894.0 | 18.312 |
| 1895.0 | 17.742 |
| 1896.0 | 18.281 |
| 1897.0 | 19.391 |
| 1898.0 | 20.128 |
| 1899.0 | 19.956 |
| 1900.0 | 19.036 |
| 1901.0 | 18.158 |
| 1902.0 | 18.228 |
| 1903.0 | 19.501 |
| 1904.0 | 20.167 |
| 1905.0 | 21.167 |
| 1906.0 | 20.686 |
| 1907.0 | 20.233 |
| 1908.0 | 18.809 |
| 1909.0 | 18.379 |
| 1910.0 | 19.173 |
| 1911.0 | 20.499 |
| 1912.0 | 20.75 |
| 1913.0 | 20.802 |
| 1914.0 | 19.704 |
| 1915.0 | 18.898 |
| 1916.0 | 17.689 |
| 1917.0 | 17.639 |
| 1918.0 | 18.575 |
| 1919.0 | 19.793 |
| 1920.0 | 20.508 |
| 1921.0 | 20.509 |
| 1922.0 | 20.063 |
| 1923.0 | 19.61 |
| 1924.0 | 19.457 |
| 1925.0 | 19.64 |
| 1926.0 | 20.046 |
| 1927.0 | 20.419 |
| 1928.0 | 20.569 |
| 1929.0 | 20.505 |
| 1930.0 | 20.347 |
| 1931.0 | 20.233 |
| 1932.0 | 20.198 |
| 1933.0 | 20.182 |
| 1934.0 | 20.152 |
| 1935.0 | 20.105 |
| 1936.0 | 20.197 |
| 1937.0 | 20.513 |
| 1938.0 | 20.875 |
| 1939.0 | 21.014 |
| 1940.0 | 20.85 |
| 1941.0 | 20.553 |
| 1942.0 | 20.41 |
| 1943.0 | 20.444 |
| 1944.0 | 20.644 |
| 1945.0 | 20.783 |
| 1946.0 | 20.825 |
| 1947.0 | 20.765 |
| 1948.0 | 20.679 |
| 1949.0 | 20.567 |
| 1950.0 | 20.507 |
| 1951.0 | 20.589 |
| 1952.0 | 20.741 |
| 1953.0 | 20.784 |
| 1954.0 | 20.727 |
| 1955.0 | 20.771 |
| 1956.0 | 20.955 |
| 1957.0 | 21.066 |
| 1958.0 | 20.986 |
| 1959.0 | 20.862 |
| 1960.0 | 20.845 |
| 1961.0 | 20.963 |
| 1962.0 | 21.019 |
| 1963.0 | 21.049 |
| 1964.0 | 21.06 |
| 1965.0 | 21.158 |
| 1966.0 | 21.207 |
| 1967.0 | 21.137 |
| 1968.0 | 21.035 |
| 1969.0 | 21.12 |
| 1970.0 | 21.381 |
| 1971.0 | 21.639 |
| 1972.0 | 21.653 |
| 1973.0 | 21.56 |
| 1974.0 | 21.465 |
| 1975.0 | 21.466 |
| 1976.0 | 21.467 |
| 1977.0 | 21.424 |
| 1978.0 | 21.364 |
| 1979.0 | 21.309 |
| 1980.0 | 21.293 |
| 1981.0 | 21.303 |
| 1982.0 | 21.334 |
| 1983.0 | 21.39 |
| 1984.0 | 21.485 |
| 1985.0 | 21.626 |
| 1986.0 | 21.797 |
| 1987.0 | 21.969 |
| 1988.0 | 22.053 |
| 1989.0 | 21.973 |
| 1990.0 | 21.738 |
| 1991.0 | 21.521 |
| 1992.0 | 21.461 |
| 1993.0 | 21.571 |
| 1994.0 | 21.756 |
| 1995.0 | 21.891 |
| 1996.0 | 21.903 |
| 1997.0 | 21.781 |
| 1998.0 | 21.668 |
| 1999.0 | 21.707 |
| 2000.065834 | 21.695 |
| 2009.942668 | 21.739 |
| 2020.098566 | 21.819 |
| 2029.969298 | 21.907 |
| 2039.837 | 21.994 |
| 2049.98346 | 22.088 |
| 2059.844971 | 22.218 |
| 2069.985031 | 22.401 |
| 2079.840289 | 22.629 |
| 2089.973887 | 22.875 |
| 2099.822832 | 23.119 |
| 2109.949906 | 23.364 |
| 2119.792477 | 23.621 |
| 2129.912964 | 23.888 |
| 2140.030088 | 24.148 |
| 2149.862941 | 24.387 |
| 2159.973384 | 24.606 |
| 2169.799712 | 24.816 |
| 2179.903413 | 25.023 |
| 2190.003671 | 25.229 |
| 2199.820052 | 25.424 |
| 2209.913475 | 25.606 |
| 2219.723179 | 25.783 |
| 2229.809704 | 25.968 |
| 2239.892708 | 26.17 |
| 2249.692237 | 26.388 |
| 2259.76825 | 26.624 |
| 2269.840694 | 26.871 |
| 2279.909553 | 27.13 |
| 2289.695271 | 27.399 |
| 2299.757015 | 27.682 |
| 2309.815127 | 27.975 |
| 2319.869592 | 28.27 |
| 2329.641254 | 28.554 |
| 2339.688478 | 28.818 |
| 2349.732008 | 29.057 |
| 2359.771828 | 29.281 |
| 2369.80792 | 29.489 |
| 2379.840271 | 29.678 |
| 2389.590342 | 29.84 |
| 2399.615266 | 29.979 |
| 2409.6364 | 30.102 |
| 2419.65373 | 30.213 |
| 2429.667238 | 30.325 |
| 2439.676909 | 30.435 |
| 2449.682728 | 30.55 |
| 2459.684679 | 30.673 |
| 2469.682745 | 30.803 |
| 2479.676911 | 30.937 |
| 2489.667162 | 31.065 |
| 2499.653481 | 31.186 |
| 2509.635853 | 31.304 |
| 2519.614261 | 31.418 |
| 2529.588691 | 31.53 |
| 2539.559127 | 31.631 |
| 2549.525552 | 31.723 |
| 2559.487951 | 31.807 |
| 2569.722871 | 31.902 |
| 2579.677058 | 32.01 |
| 2589.627171 | 32.136 |
| 2599.573195 | 32.266 |
| 2609.515113 | 32.403 |
| 2619.452911 | 32.536 |
| 2629.662448 | 32.672 |
| 2639.591842 | 32.806 |
| 2649.517067 | 32.934 |
| 2659.438109 | 33.017 |
| 2669.630358 | 33.038 |
| 2679.542867 | 32.975 |
| 2689.451145 | 32.799 |
| 2699.630227 | 32.411 |
| 2709.529877 | 31.671 |
| 2719.425248 | 30.431 |
| 2729.591015 | 28.612 |
| 2739.477662 | 26.251 |
| 2749.359982 | 23.486 |
| 2759.512287 | 20.475 |
| 2769.385788 | 17.33 |
| 2779.528995 | 14.164 |
| 2789.393611 | 11.121 |
| 2799.527654 | 8.389 |
| 2809.383323 | 6.125 |
| 2819.508136 | 4.415 |
| 2829.354792 | 3.233 |
| 2839.47031 | 2.48 |
| 2849.30789 | 2.023 |
| 2859.414046 | 1.766 |
| 2869.515434 | 1.637 |
| 2879.339216 | 1.589 |
| 2889.431143 | 1.582 |
| 2899.24569 | 1.602 |
| 2909.328092 | 1.64 |
| 2919.40564 | 1.69 |
| 2929.206149 | 1.752 |
| 2939.274073 | 1.821 |
| 2949.337095 | 1.899 |
| 2959.395197 | 1.987 |
| 2969.17672 | 2.082 |
| 2979.225066 | 2.184 |
| 2989.268442 | 2.29 |
| 2999.306833 | 2.401 |
| 3009.34022 | 2.526 |
| 3019.368587 | 2.666 |
| 3029.391918 | 2.825 |
| 3039.139497 | 2.995 |
| 3049.152842 | 3.173 |
| 3059.1611 | 3.347 |
| 3069.164256 | 3.52 |
| 3079.162292 | 3.697 |
| 3089.155191 | 3.887 |
| 3099.142938 | 4.073 |
| 3109.125515 | 4.248 |
| 3119.102905 | 4.42 |
| 3129.075093 | 4.606 |
| 3139.311366 | 4.818 |
| 3149.272956 | 5.053 |
| 3159.229293 | 5.31 |
| 3169.18036 | 5.577 |
| 3179.126141 | 5.84 |
| 3189.066618 | 6.102 |
| 3199.27022 | 6.373 |
| 3209.199897 | 6.65 |
| 3219.124221 | 6.917 |
| 3229.043176 | 7.161 |
| 3239.224603 | 7.386 |
| 3249.132622 | 7.596 |
| 3259.035221 | 7.801 |
| 3269.199799 | 8.003 |
| 3279.091361 | 8.201 |
| 3288.977454 | 8.374 |
| 3299.125027 | 8.519 |
| 3308.999981 | 8.622 |
| 3319.136081 | 8.689 |
| 3328.999829 | 8.708 |
| 3339.124385 | 8.678 |
| 3348.976861 | 8.595 |
| 3359.089804 | 8.456 |
| 3368.930939 | 8.27 |
| 3379.0322 | 8.032 |
| 3389.127517 | 8.032 |
| 3398.951437 | 7.882 |
| 3409.034967 | 7.713 |
| 3419.112499 | 7.527 |
| 3428.919052 | 7.325 |
| 3438.984693 | 7.112 |
| 3449.044284 | 6.889 |
| 3458.833318 | 6.657 |
| 3468.880914 | 6.421 |
| 3478.922407 | 6.181 |
| 3488.957779 | 5.941 |
| 3498.987012 | 5.703 |
| 3509.010089 | 5.468 |
| 3519.026992 | 5.24 |
| 3529.037703 | 5.019 |
| 3538.779008 | 4.806 |
| 3548.777448 | 4.602 |
| 3558.769643 | 4.408 |
| 3568.755577 | 4.224 |
| 3578.997769 | 4.051 |
| 3588.970961 | 3.888 |
| 3598.937838 | 3.737 |
| 3608.898383 | 3.596 |
| 3618.852578 | 3.466 |
| 3628.800407 | 3.345 |
| 3638.74185 | 3.234 |
| 3648.938253 | 3.131 |
| 3658.866705 | 3.035 |
| 3668.788719 | 2.945 |
| 3678.704279 | 2.862 |
| 3688.874043 | 2.784 |
| 3698.776469 | 2.711 |
| 3708.672387 | 2.642 |
| 3718.821938 | 2.578 |
| 3728.704616 | 2.517 |
| 3738.840542 | 2.459 |
| 3748.709907 | 2.405 |
| 3758.832135 | 2.353 |
| 3768.688117 | 2.304 |
| 3778.796573 | 2.258 |
| 3788.639101 | 2.214 |
| 3798.733711 | 2.172 |
| 3808.821282 | 2.131 |
| 3818.643407 | 2.093 |
| 3828.717023 | 2.057 |
| 3838.783543 | 2.022 |
| 3848.585104 | 1.988 |
| 3858.637559 | 1.956 |
| 3868.682864 | 1.925 |
| 3878.720999 | 1.895 |
| 3888.751945 | 1.867 |
| 3898.518755 | 1.839 |
| 3908.535455 | 1.813 |
| 3918.54491 | 1.787 |
| 3928.547104 | 1.763 |
| 3938.542016 | 1.739 |
| 3948.52963 | 1.716 |
| 3958.509925 | 1.694 |
| 3968.482884 | 1.672 |
| 3978.70392 | 1.652 |
| 3988.661962 | 1.632 |
| 3998.612612 | 1.612 |
| 4008.555852 | 1.593 |
| 4018.491662 | 1.575 |
| 4028.6745 | 1.557 |
| 4038.595205 | 1.54 |
| 4048.508426 | 1.523 |
| 4058.414143 | 1.507 |
| 4068.56604 | 1.491 |
| 4078.456503 | 1.476 |
| 4088.592715 | 1.461 |
| 4098.467848 | 1.447 |
| 4108.588299 | 1.433 |
| 4118.448027 | 1.419 |
| 4128.552639 | 1.406 |
| 4138.396887 | 1.393 |
| 4148.485584 | 1.38 |
| 4158.566193 | 1.368 |
| 4168.386981 | 1.356 |
| 4178.45156 | 1.344 |
| 4188.507992 | 1.332 |
| 4198.305151 | 1.321 |
| 4208.345437 | 1.31 |
| 4218.377519 | 1.3 |
| 4228.401377 | 1.289 |
| 4238.416991 | 1.279 |
| 4248.424343 | 1.269 |
| 4258.423411 | 1.259 |
| 4268.414178 | 1.25 |
| 4278.396623 | 1.24 |
| 4288.370728 | 1.231 |
| 4298.336471 | 1.222 |
| 4308.293836 | 1.213 |
| 4318.2428 | 1.204 |
| 4328.431752 | 1.196 |
| 4338.363649 | 1.187 |
| 4348.287088 | 1.179 |
| 4358.20205 | 1.171 |
| 4368.356068 | 1.163 |
| 4378.253805 | 1.156 |
| 4388.390126 | 1.148 |
| 4398.270558 | 1.14 |
| 4408.389101 | 1.133 |
| 4418.252149 | 1.126 |
| 4428.352834 | 1.119 |
| 4438.198419 | 1.112 |
| 4448.281165 | 1.105 |
| 4458.354799 | 1.099 |
| 4468.173935 | 1.092 |
| 4478.229508 | 1.086 |
| 4488.275909 | 1.079 |
| 4498.313117 | 1.073 |
| 4508.096635 | 1.067 |
| 4518.115621 | 1.061 |
| 4528.125352 | 1.055 |
| 4538.125809 | 1.05 |
| 4548.11697 | 1.044 |
| 4558.098816 | 1.039 |
| 4568.071325 | 1.033 |
| 4578.277365 | 1.028 |
| 4588.230912 | 1.023 |
| 4598.175061 | 1.017 |
| 4608.109792 | 1.012 |
| 4618.035085 | 1.007 |
| 4628.192649 | 1.002 |
| 4638.098772 | 0.998 |
| 4647.995395 | 0.993 |
| 4658.123528 | 0.988 |
| 4668.000857 | 0.984 |
| 4678.109183 | 0.979 |
| 4687.967136 | 0.975 |
| 4698.05557 | 0.97 |
| 4708.133906 | 0.966 |
| 4717.962521 | 0.962 |
| 4728.020838 | 0.958 |
| 4738.068993 | 0.954 |
| 4748.106964 | 0.95 |
| 4758.13473 | 0.946 |
| 4767.913874 | 0.942 |
| 4777.921408 | 0.938 |
| 4787.918673 | 0.934 |
| 4797.905646 | 0.93 |
| 4807.882307 | 0.927 |
| 4818.085802 | 0.923 |
| 4828.041526 | 0.919 |
| 4837.986874 | 0.916 |
| 4847.921823 | 0.912 |
| 4857.846351 | 0.909 |
| 4867.996361 | 0.905 |
| 4877.899737 | 0.902 |
| 4888.028045 | 0.899 |
| 4897.910179 | 0.895 |
| 4908.016697 | 0.892 |
| 4917.877504 | 0.889 |
| 4927.962141 | 0.886 |
| 4937.801534 | 0.883 |
| 4947.864203 | 0.88 |
| 4957.915724 | 0.877 |
| 4967.956075 | 0.874 |
| 4977.985234 | 0.871 |
| 4987.77033 | 0.868 |
| 4997.777298 | 0.865 |
| 5007.776688 | 0.862 |
| 5017.595804 | 0.86 |
| 5028.169082 | 0.857 |
| 5037.98605 | 0.854 |
| 5047.80198 | 0.851 |
| 5057.616872 | 0.849 |
| 5068.18559 | 0.846 |
| 5077.998316 | 0.844 |
| 5087.809996 | 0.841 |
| 5097.620628 | 0.839 |
| 5107.430211 | 0.836 |
| 5117.993201 | 0.834 |
| 5127.800597 | 0.831 |
| 5137.606938 | 0.829 |
| 5147.41222 | 0.827 |
| 5157.970569 | 0.824 |
| 5167.773648 | 0.822 |
| 5177.575662 | 0.82 |
| 5187.376611 | 0.817 |
| 5197.930283 | 0.815 |
| 5207.729011 | 0.813 |
| 5217.526666 | 0.811 |
| 5227.323247 | 0.809 |
| 5237.872207 | 0.807 |
| 5247.666549 | 0.804 |
| 5257.459812 | 0.802 |
| 5268.005191 | 0.8 |
| 5277.796202 | 0.798 |
| 5287.586127 | 0.796 |
| 5297.374963 | 0.794 |
| 5307.915566 | 0.792 |
| 5317.702134 | 0.791 |
| 5327.487607 | 0.789 |
| 5337.271982 | 0.787 |
| 5347.807773 | 0.785 |
| 5357.589864 | 0.783 |
| 5367.370852 | 0.781 |
| 5377.902987 | 0.779 |
| 5387.681677 | 0.778 |
| 5397.459258 | 0.776 |
| 5407.235727 | 0.774 |
| 5417.762987 | 0.773 |
| 5427.537141 | 0.771 |
| 5437.310177 | 0.769 |
| 5447.833734 | 0.768 |
| 5457.604442 | 0.766 |
| 5467.374028 | 0.764 |
| 5477.142487 | 0.763 |
| 5487.661104 | 0.761 |
| 5497.427219 | 0.76 |
| 5507.192201 | 0.758 |
| 5517.707068 | 0.757 |
| 5527.469693 | 0.755 |
| 5537.231179 | 0.754 |
| 5547.742274 | 0.752 |
| 5557.50139 | 0.751 |
| 5567.259362 | 0.749 |
| 5577.766665 | 0.748 |
| 5587.522253 | 0.746 |
| 5597.276691 | 0.745 |
| 5607.780182 | 0.744 |
| 5617.532223 | 0.742 |
| 5627.283108 | 0.741 |
| 5637.032835 | 0.74 |
| 5647.531242 | 0.738 |
| 5657.278555 | 0.737 |
| 5667.024703 | 0.736 |
| 5677.51925 | 0.734 |
| 5687.262972 | 0.733 |
| 5697.005523 | 0.732 |
| 5707.496189 | 0.731 |
| 5717.236302 | 0.729 |
| 5726.975237 | 0.728 |
| 5737.462002 | 0.727 |
| 5747.198485 | 0.726 |
| 5757.682605 | 0.725 |
| 5767.416629 | 0.723 |
| 5777.149464 | 0.722 |
| 5787.629649 | 0.721 |
| 5797.360012 | 0.72 |
| 5807.08918 | 0.719 |
| 5817.565409 | 0.718 |
| 5827.292092 | 0.716 |
| 5837.017575 | 0.715 |
| 5847.489828 | 0.714 |
| 5857.212813 | 0.713 |
| 5866.934591 | 0.712 |
| 5877.402847 | 0.711 |
| 5887.122114 | 0.71 |
| 5897.587661 | 0.709 |
| 5907.304408 | 0.708 |
| 5917.019938 | 0.707 |
| 5927.481454 | 0.706 |
| 5937.194452 | 0.705 |
| 5946.906226 | 0.704 |
| 5957.363691 | 0.703 |
| 5967.072921 | 0.702 |
| 5977.52764 | 0.701 |
| 5987.234315 | 0.7 |
| 5996.939757 | 0.699 |
| 6007.39039 | 0.698 |
| 6017.093265 | 0.697 |
| 6026.794901 | 0.696 |
| 6037.241429 | 0.695 |
| 6046.940485 | 0.694 |
| 6057.38423 | 0.693 |
| 6067.080698 | 0.692 |
| 6076.775917 | 0.691 |
| 6087.215522 | 0.69 |
| 6096.908139 | 0.689 |
| 6107.344938 | 0.688 |
| 6117.034946 | 0.687 |
| 6126.723694 | 0.686 |
| 6137.156319 | 0.685 |
| 6146.842444 | 0.684 |
| 6157.272241 | 0.683 |
| 6166.955735 | 0.682 |
| 6177.382693 | 0.681 |
| 6187.063548 | 0.68 |
| 6196.743128 | 0.679 |
| 6207.165865 | 0.678 |
| 6216.842793 | 0.677 |
| 6227.262668 | 0.677 |
| 6236.936935 | 0.676 |
| 6246.609918 | 0.675 |
| 6257.025537 | 0.674 |
| 6266.695846 | 0.673 |
| 6277.108582 | 0.672 |
| 6286.776208 | 0.671 |
| 6297.18605 | 0.671 |
| 6306.850986 | 0.67 |
| 6317.257926 | 0.669 |
| 6326.920162 | 0.668 |
| 6336.581095 | 0.667 |
| 6346.983717 | 0.667 |
| 6356.641938 | 0.666 |
| 6367.041635 | 0.665 |
| 6376.697135 | 0.664 |
| 6387.093897 | 0.664 |
| 6396.746668 | 0.663 |
| 6407.140486 | 0.662 |
| 6416.790518 | 0.661 |
| 6427.181383 | 0.661 |
| 6436.828669 | 0.66 |
| 6446.47463 | 0.659 |
| 6456.861103 | 0.658 |
| 6466.504304 | 0.658 |
| 6476.8878 | 0.657 |
| 6486.528234 | 0.656 |
| 6496.908745 | 0.656 |
| 6506.546402 | 0.655 |
| 6516.923919 | 0.654 |
| 6526.558791 | 0.653 |
| 6536.933304 | 0.653 |
| 6546.565382 | 0.652 |
| 6556.936882 | 0.651 |
| 6566.566159 | 0.651 |
| 6576.934637 | 0.65 |
| 6586.561102 | 0.649 |
| 6596.926549 | 0.648 |
| 6606.550195 | 0.648 |
| 6616.912601 | 0.647 |
| 6626.53342 | 0.646 |
| 6636.892776 | 0.646 |
| 6646.510758 | 0.645 |
| 6656.867055 | 0.644 |
| 6666.482193 | 0.643 |
| 6676.835422 | 0.643 |
| 6686.447706 | 0.642 |
| 6696.797857 | 0.641 |
| 6706.40728 | 0.64 |
| 6716.754344 | 0.64 |
| 6726.360896 | 0.639 |
| 6736.704865 | 0.638 |
| 6746.308538 | 0.637 |
| 6756.649402 | 0.636 |
| 6766.250188 | 0.636 |
| 6776.587937 | 0.635 |
| 6786.924068 | 0.634 |
| 6796.520453 | 0.633 |
| 6806.853456 | 0.632 |
| 6816.446931 | 0.632 |
| 6826.776797 | 0.631 |
| 6836.367355 | 0.63 |
| 6846.694074 | 0.629 |
| 6856.281707 | 0.629 |
| 6866.60527 | 0.628 |
| 6876.189968 | 0.627 |
| 6886.510366 | 0.626 |
| 6896.82912 | 0.625 |
| 6906.409345 | 0.625 |
| 6916.724921 | 0.624 |
| 6926.30219 | 0.623 |
| 6936.614577 | 0.622 |
| 6946.188882 | 0.622 |
| 6956.498072 | 0.621 |
| 6966.805601 | 0.62 |
| 6976.375388 | 0.619 |
| 6986.679706 | 0.618 |
| 6996.246507 | 0.618 |
| 7006.547605 | 0.617 |
| 7016.111412 | 0.616 |
| 7026.40928 | 0.615 |
| 7036.70547 | 0.615 |
| 7046.264714 | 0.614 |
| 7056.557661 | 0.613 |
| 7066.113889 | 0.613 |
| 7076.403584 | 0.612 |
| 7086.691589 | 0.611 |
| 7096.243221 | 0.61 |
| 7106.527959 | 0.61 |
| 7116.076554 | 0.609 |
| 7126.358018 | 0.608 |
| 7136.637779 | 0.608 |
| 7146.181746 | 0.607 |
| 7156.458218 | 0.606 |
| 7165.999126 | 0.606 |
| 7176.2723 | 0.605 |
| 7186.54376 | 0.604 |
| 7196.080008 | 0.604 |
| 7206.348156 | 0.603 |
| 7216.614582 | 0.602 |
| 7226.14615 | 0.602 |
| 7236.409251 | 0.601 |
| 7245.937725 | 0.6 |
| 7256.197491 | 0.599 |
| 7266.455524 | 0.599 |
| 7275.979286 | 0.598 |
| 7286.23397 | 0.597 |
| 7296.486914 | 0.597 |
| 7306.005944 | 0.596 |
| 7316.255525 | 0.595 |
| 7326.503358 | 0.595 |
| 7336.017637 | 0.594 |
| 7346.262094 | 0.593 |
| 7356.504797 | 0.592 |
| 7366.014304 | 0.592 |
| 7376.253616 | 0.591 |
| 7386.491167 | 0.59 |
| 7395.995884 | 0.59 |
| 7406.23003 | 0.589 |
| 7416.462408 | 0.588 |
| 7425.962315 | 0.587 |
| 7436.191274 | 0.587 |
| 7446.418458 | 0.586 |
| 7455.913536 | 0.585 |
| 7466.137287 | 0.585 |
| 7476.359256 | 0.584 |
| 7485.849485 | 0.583 |
| 7496.068008 | 0.582 |
| 7506.284741 | 0.582 |
| 7515.770101 | 0.581 |
| 7525.983375 | 0.58 |
| 7536.19485 | 0.58 |
| 7545.675324 | 0.579 |
| 7555.883326 | 0.578 |
| 7566.089524 | 0.577 |
| 7576.293916 | 0.577 |
| 7585.767802 | 0.576 |
| 7595.968701 | 0.575 |
| 7606.167786 | 0.575 |
| 7615.636739 | 0.574 |
| 7625.832319 | 0.573 |
| 7636.026078 | 0.573 |
| 7646.218013 | 0.572 |
| 7655.680318 | 0.571 |
| 7665.868729 | 0.57 |
| 7676.05531 | 0.57 |
| 7686.240057 | 0.569 |
| 7695.695679 | 0.568 |
| 7705.876884 | 0.568 |
| 7716.056248 | 0.567 |
| 7726.23377 | 0.566 |
| 7735.682674 | 0.566 |
| 7745.856636 | 0.565 |
| 7756.028747 | 0.564 |
| 7766.199006 | 0.564 |
| 7775.641157 | 0.563 |
| 7785.807837 | 0.562 |
| 7795.972657 | 0.561 |
| 7806.135616 | 0.561 |
| 7815.57098 | 0.56 |
| 7825.730341 | 0.559 |
| 7835.887833 | 0.559 |
| 7846.043454 | 0.558 |
| 7855.471995 | 0.557 |
| 7865.624 | 0.557 |
| 7875.774127 | 0.556 |
| 7885.922372 | 0.555 |
| 7896.068734 | 0.555 |
| 7905.488668 | 0.554 |
| 7915.631391 | 0.553 |
| 7925.772224 | 0.553 |
| 7935.911164 | 0.552 |
| 7946.048209 | 0.551 |
| 7955.45948 | 0.551 |
| 7965.592863 | 0.55 |
| 7975.724343 | 0.549 |
| 7985.853919 | 0.548 |
| 7995.981587 | 0.548 |
| 8005.384141 | 0.547 |
| 8015.508125 | 0.546 |
| 8025.630194 | 0.546 |
| 8035.750346 | 0.545 |
| 8045.86858 | 0.544 |
| 8055.984892 | 0.544 |
| 8065.376887 | 0.543 |
| 8075.489487 | 0.542 |
| 8085.600158 | 0.541 |
| 8095.708897 | 0.541 |
| 8105.815704 | 0.54 |
| 8115.920574 | 0.539 |
| 8125.301933 | 0.538 |
| 8135.403063 | 0.537 |
| 8145.502251 | 0.537 |
| 8155.599493 | 0.536 |
| 8165.694787 | 0.535 |
| 8175.788131 | 0.534 |
| 8185.879523 | 0.533 |
| 8195.248351 | 0.533 |
| 8205.33597 | 0.532 |
| 8215.42163 | 0.531 |
| 8225.505327 | 0.53 |
| 8235.587061 | 0.53 |
| 8245.666827 | 0.529 |
| 8255.744624 | 0.528 |
| 8265.82045 | 0.527 |
| 8275.174806 | 0.527 |
| 8285.246822 | 0.526 |
| 8295.31686 | 0.526 |
| 8305.384917 | 0.525 |
| 8315.45099 | 0.524 |
| 8325.515077 | 0.524 |
| 8335.577176 | 0.523 |
| 8345.637284 | 0.523 |
| 8355.695399 | 0.522 |
| 8365.751519 | 0.522 |
| 8375.087555 | 0.521 |
| 8385.139819 | 0.521 |
| 8395.190081 | 0.52 |
| 8405.238338 | 0.52 |
| 8415.284587 | 0.519 |
| 8425.328827 | 0.519 |
| 8435.371055 | 0.518 |
| 8445.411268 | 0.518 |
| 8455.449464 | 0.517 |
| 8465.485641 | 0.517 |
| 8475.519796 | 0.516 |
| 8485.551927 | 0.516 |
| 8495.582031 | 0.515 |
| 8505.610107 | 0.515 |
| 8515.636151 | 0.514 |
| 8525.660162 | 0.514 |
| 8535.682136 | 0.514 |
| 8544.98643 | 0.513 |
| 8555.004471 | 0.513 |
| 8565.020468 | 0.512 |
| 8575.034421 | 0.512 |
| 8585.046325 | 0.511 |
| 8595.056179 | 0.511 |
| 8605.063981 | 0.511 |
| 8615.069727 | 0.51 |
| 8625.073416 | 0.51 |
| 8635.075045 | 0.509 |
| 8645.074612 | 0.509 |
| 8655.072114 | 0.508 |
| 8665.067549 | 0.508 |
| 8675.060915 | 0.508 |
| 8685.052209 | 0.507 |
| 8695.041429 | 0.507 |
| 8705.028573 | 0.506 |
| 8715.013637 | 0.506 |
| 8724.99662 | 0.506 |
| 8734.977519 | 0.505 |
| 8744.956333 | 0.505 |
| 8754.933058 | 0.505 |
| 8764.907692 | 0.504 |
| 8774.880232 | 0.504 |
| 8784.850677 | 0.504 |
| 8794.819025 | 0.503 |
| 8804.785271 | 0.503 |
| 8815.461059 | 0.502 |
| 8825.422948 | 0.502 |
| 8835.382728 | 0.502 |
| 8845.340399 | 0.501 |
| 8855.295957 | 0.501 |
| 8865.249401 | 0.501 |
| 8875.200727 | 0.5 |
| 8885.149933 | 0.5 |
| 8895.097018 | 0.5 |
| 8905.041978 | 0.499 |
| 8914.984812 | 0.499 |
| 8924.925517 | 0.499 |
| 8934.86409 | 0.498 |
| 8944.800529 | 0.498 |
| 8954.734832 | 0.498 |
| 8965.376355 | 0.497 |
| 8975.306225 | 0.497 |
| 8985.233952 | 0.497 |
| 8995.159534 | 0.496 |
| 9005.082967 | 0.496 |
| 9015.004249 | 0.496 |
| 9024.923378 | 0.495 |
| 9034.840353 | 0.495 |
| 9044.755169 | 0.495 |
| 9054.667825 | 0.494 |
| 9065.286129 | 0.494 |
| 9075.194303 | 0.494 |
| 9085.10031 | 0.493 |
| 9095.004147 | 0.493 |
| 9104.905813 | 0.493 |
| 9114.805303 | 0.492 |
| 9124.702617 | 0.492 |
| 9134.597752 | 0.492 |
| 9145.197262 | 0.491 |
| 9155.087875 | 0.491 |
| 9164.976302 | 0.491 |
| 9174.86254 | 0.49 |
| 9184.746587 | 0.49 |
| 9194.628441 | 0.49 |
| 9204.508098 | 0.489 |
| 9215.091006 | 0.489 |
| 9224.966108 | 0.489 |
| 9234.839006 | 0.488 |
| 9244.709699 | 0.488 |
| 9254.578185 | 0.488 |
| 9265.149109 | 0.487 |
| 9275.013013 | 0.487 |
| 9284.874702 | 0.487 |
| 9294.734174 | 0.486 |
| 9304.591426 | 0.486 |
| 9314.446456 | 0.486 |
| 9325.002949 | 0.485 |
| 9334.853368 | 0.485 |
| 9344.701558 | 0.485 |
| 9354.547517 | 0.484 |
| 9364.391241 | 0.484 |
| 9374.935607 | 0.484 |
| 9384.774696 | 0.484 |
| 9394.611544 | 0.483 |
| 9404.446148 | 0.483 |
| 9414.980732 | 0.483 |
| 9424.810682 | 0.482 |
| 9434.63838 | 0.482 |
| 9444.463825 | 0.482 |
| 9454.988585 | 0.481 |
| 9464.809356 | 0.481 |
| 9474.627866 | 0.481 |
| 9484.444114 | 0.48 |
| 9494.959008 | 0.48 |
| 9504.770561 | 0.48 |
| 9514.579844 | 0.48 |
| 9524.386855 | 0.479 |
| 9534.891842 | 0.479 |
| 9544.694139 | 0.479 |
| 9554.494156 | 0.478 |
| 9564.291891 | 0.478 |
| 9574.786929 | 0.478 |
| 9584.57993 | 0.478 |
| 9594.370643 | 0.477 |
| 9604.858149 | 0.477 |
| 9614.644112 | 0.477 |
| 9624.427779 | 0.476 |
| 9634.209147 | 0.476 |
| 9644.686632 | 0.476 |
| 9654.463232 | 0.476 |
| 9664.237526 | 0.475 |
| 9674.707423 | 0.475 |
| 9684.476934 | 0.475 |
| 9694.244132 | 0.474 |
| 9704.706417 | 0.474 |
| 9714.468817 | 0.474 |
| 9724.228897 | 0.474 |
| 9734.683548 | 0.473 |
| 9744.438814 | 0.473 |
| 9754.191753 | 0.473 |
| 9764.638746 | 0.473 |
| 9774.386857 | 0.472 |
| 9784.132634 | 0.472 |
| 9794.571945 | 0.472 |
| 9804.312879 | 0.472 |
| 9814.746996 | 0.471 |
| 9824.483078 | 0.471 |
| 9834.216813 | 0.471 |
| 9844.643209 | 0.47 |
| 9854.372076 | 0.47 |
| 9864.09859 | 0.47 |
| 9874.517241 | 0.47 |
| 9884.238873 | 0.469 |
| 9894.652288 | 0.469 |
| 9904.369027 | 0.469 |
| 9914.083402 | 0.469 |
| 9924.489032 | 0.468 |
| 9934.198499 | 0.468 |
| 9944.598867 | 0.468 |
| 9954.303417 | 0.468 |
| 9964.00559 | 0.467 |
| 9974.398135 | 0.467 |
| 9984.095376 | 0.467 |
| 9994.482631 | 0.467 |
| 10004.17493 | 0.466 |
| 10014.55689 | 0.466 |
| 10024.24423 | 0.466 |
| 10033.92919 | 0.466 |
| 10044.30326 | 0.466 |
| 10053.98325 | 0.465 |
| 10064.352 | 0.465 |
| 10074.02701 | 0.465 |
| 10084.39043 | 0.465 |
| 10094.06045 | 0.464 |
| 10104.41852 | 0.464 |
| 10114.08355 | 0.464 |
| 10124.43625 | 0.464 |
| 10134.09628 | 0.463 |
| 10144.44362 | 0.463 |
| 10154.09862 | 0.463 |
| 10164.44058 | 0.463 |
| 10174.09056 | 0.463 |
| 10184.42713 | 0.462 |
| 10194.07208 | 0.462 |
| 10204.40325 | 0.462 |
| 10214.04315 | 0.462 |
| 10224.36891 | 0.461 |
| 10234.00375 | 0.461 |
| 10244.32409 | 0.461 |
| 10253.95386 | 0.461 |
| 10264.26877 | 0.46 |
| 10273.89347 | 0.46 |
| 10284.20293 | 0.46 |
| 10293.82255 | 0.46 |
| 10304.12656 | 0.46 |
| 10313.74108 | 0.459 |
| 10324.03963 | 0.459 |
| 10334.33534 | 0.459 |
| 10343.94211 | 0.459 |
| 10354.23234 | 0.459 |
| 10363.834 | 0.458 |
| 10374.11874 | 0.458 |
| 10383.71527 | 0.458 |
| 10393.99451 | 0.458 |
| 10404.2709 | 0.457 |
| 10413.85962 | 0.457 |
| 10424.1305 | 0.457 |
| 10433.71407 | 0.457 |
| 10443.97941 | 0.457 |
| 10454.2419 | 0.456 |
| 10463.81763 | 0.456 |
| 10474.07457 | 0.456 |
| 10483.64512 | 0.456 |
| 10493.8965 | 0.456 |
| 10504.14501 | 0.455 |
| 10513.70769 | 0.455 |
| 10523.95063 | 0.455 |
| 10534.19068 | 0.455 |
| 10543.74545 | 0.455 |
| 10553.97992 | 0.454 |
| 10564.21149 | 0.454 |
| 10573.75835 | 0.454 |
| 10583.98432 | 0.454 |
| 10593.52594 | 0.454 |
| 10603.7463 | 0.453 |
| 10613.96375 | 0.453 |
| 10624.17829 | 0.453 |
| 10633.70924 | 0.453 |
| 10643.91815 | 0.453 |
| 10654.12414 | 0.452 |
| 10663.64709 | 0.452 |
| 10673.84743 | 0.452 |
| 10684.04485 | 0.452 |
| 10693.55979 | 0.452 |
| 10703.75154 | 0.452 |
| 10713.94035 | 0.451 |
| 10723.44726 | 0.451 |
| 10733.6304 | 0.451 |
| 10743.81059 | 0.451 |
| 10753.98783 | 0.451 |
| 10763.48393 | 0.451 |
| 10773.65548 | 0.45 |
| 10783.82407 | 0.45 |
| 10793.9897 | 0.45 |
| 10803.47495 | 0.45 |
| 10813.63486 | 0.45 |
| 10823.7918 | 0.45 |
| 10833.94578 | 0.449 |
| 10843.42014 | 0.449 |
| 10853.56838 | 0.449 |
| 10863.71363 | 0.449 |
| 10873.85591 | 0.449 |
| 10883.31935 | 0.449 |
| 10893.45586 | 0.448 |
| 10903.58938 | 0.448 |
| 10913.71992 | 0.448 |
| 10923.84746 | 0.448 |
| 10933.29714 | 0.448 |
| 10943.41889 | 0.448 |
| 10953.53764 | 0.448 |
| 10963.65339 | 0.447 |
| 10973.76613 | 0.447 |
| 10983.87586 | 0.447 |
| 10993.3089 | 0.447 |
| 11003.41281 | 0.447 |
| 11013.5137 | 0.447 |
| 11023.61157 | 0.446 |
| 11033.70642 | 0.446 |
| 11043.79825 | 0.446 |
| 11053.21456 | 0.446 |
| 11063.30053 | 0.446 |
| 11073.38346 | 0.446 |
| 11083.46337 | 0.446 |
| 11093.54023 | 0.445 |
| 11103.61405 | 0.445 |
| 11113.68483 | 0.445 |
| 11123.75256 | 0.445 |
| 11133.14635 | 0.445 |
| 11143.20819 | 0.445 |
| 11153.26696 | 0.444 |
| 11163.32268 | 0.444 |
| 11173.37534 | 0.444 |
| 11183.42494 | 0.444 |
| 11193.47147 | 0.444 |
| 11203.51493 | 0.444 |
| 11213.55532 | 0.444 |
| 11223.59263 | 0.443 |
| 11233.62687 | 0.443 |
| 11243.65803 | 0.443 |
| 11253.6861 | 0.443 |
| 11263.71109 | 0.443 |
| 11273.06496 | 0.443 |
| 11283.08398 | 0.443 |
| 11293.09991 | 0.442 |
| 11303.11274 | 0.442 |
| 11313.12247 | 0.442 |
| 11323.12909 | 0.442 |
| 11333.13262 | 0.442 |
| 11343.13303 | 0.442 |
| 11353.13034 | 0.442 |
| 11363.12453 | 0.442 |
| 11373.11561 | 0.441 |
| 11383.10358 | 0.441 |
| 11393.08842 | 0.441 |
| 11403.07013 | 0.441 |
| 11413.04872 | 0.441 |
| 11423.02418 | 0.441 |
| 11432.99651 | 0.441 |
| 11442.96571 | 0.44 |
| 11452.93177 | 0.44 |
| 11463.55877 | 0.44 |
| 11473.51834 | 0.44 |
| 11483.47476 | 0.44 |
| 11493.42803 | 0.44 |
| 11503.37815 | 0.44 |
| 11513.32512 | 0.44 |
| 11523.26893 | 0.439 |
| 11533.20958 | 0.439 |
| 11543.14707 | 0.439 |
| 11553.0814 | 0.439 |
| 11563.01256 | 0.439 |
| 11572.94055 | 0.439 |
| 11582.86536 | 0.439 |
| 11593.44833 | 0.439 |
| 11603.36658 | 0.438 |
| 11613.28165 | 0.438 |
| 11623.19353 | 0.438 |
| 11633.10223 | 0.438 |
| 11643.00774 | 0.438 |
| 11652.91006 | 0.438 |
| 11662.80918 | 0.438 |
| 11673.36472 | 0.438 |
| 11683.25723 | 0.437 |
| 11693.14654 | 0.437 |
| 11703.03264 | 0.437 |
| 11712.91554 | 0.437 |
| 11722.79522 | 0.437 |
| 11733.33001 | 0.437 |
| 11743.20304 | 0.437 |
| 11753.07286 | 0.437 |
| 11762.93946 | 0.437 |
| 11772.80283 | 0.436 |
| 11783.3202 | 0.436 |
| 11793.1769 | 0.436 |
| 11803.03036 | 0.436 |
| 11812.88059 | 0.436 |
| 11822.72758 | 0.436 |
| 11833.22747 | 0.436 |
| 11843.06776 | 0.436 |
| 11852.9048 | 0.436 |
| 11862.73859 | 0.435 |
| 11873.22439 | 0.435 |
| 11883.05145 | 0.435 |
| 11892.87526 | 0.435 |
| 11902.69581 | 0.435 |
| 11913.16747 | 0.435 |
| 11922.98127 | 0.435 |
| 11932.79181 | 0.435 |
| 11942.59907 | 0.435 |
| 11953.05654 | 0.434 |
| 11962.85704 | 0.434 |
| 11972.65425 | 0.434 |
| 11983.10099 | 0.434 |
| 11992.89142 | 0.434 |
| 12002.67856 | 0.434 |
| 12013.11455 | 0.434 |
| 12022.89488 | 0.434 |
| 12032.67192 | 0.434 |
| 12043.09713 | 0.434 |
| 12052.86735 | 0.433 |
| 12062.63426 | 0.433 |
| 12073.04866 | 0.433 |
| 12082.80874 | 0.433 |
| 12092.5655 | 0.433 |
| 12102.96906 | 0.433 |
| 12112.71897 | 0.433 |
| 12122.46556 | 0.433 |
| 12132.85826 | 0.433 |
| 12142.59798 | 0.433 |
| 12152.98334 | 0.432 |
| 12162.71618 | 0.432 |
| 12172.44568 | 0.432 |
| 12182.82013 | 0.432 |
| 12192.54273 | 0.432 |
| 12202.90982 | 0.432 |
| 12212.62551 | 0.432 |
| 12222.98523 | 0.432 |
| 12232.69399 | 0.432 |
| 12242.39941 | 0.432 |
| 12252.74815 | 0.431 |
| 12262.44662 | 0.431 |
| 12272.78796 | 0.431 |
| 12282.47948 | 0.431 |
| 12292.81339 | 0.431 |
| 12302.49796 | 0.431 |
| 12312.82444 | 0.431 |
| 12322.50203 | 0.431 |
| 12332.82106 | 0.431 |
| 12342.49167 | 0.431 |
| 12352.80325 | 0.431 |
| 12362.46686 | 0.431 |
| 12372.77097 | 0.43 |
| 12382.42757 | 0.43 |
| 12392.7242 | 0.43 |
| 12402.37378 | 0.43 |
| 12412.66292 | 0.43 |
| 12422.30547 | 0.43 |
| 12432.58711 | 0.43 |
| 12442.22262 | 0.43 |
| 12452.49673 | 0.43 |
| 12462.76697 | 0.43 |
| 12472.39178 | 0.43 |
| 12482.65448 | 0.43 |
| 12492.27222 | 0.43 |
| 12502.52738 | 0.429 |
| 12512.77863 | 0.429 |
| 12522.38563 | 0.429 |
| 12532.62932 | 0.429 |
| 12542.22922 | 0.429 |
| 12552.46533 | 0.429 |
| 12562.69753 | 0.429 |
| 12572.28665 | 0.429 |
| 12582.51125 | 0.429 |
| 12592.73192 | 0.429 |
| 12602.31024 | 0.429 |
| 12612.5233 | 0.429 |
| 12622.09447 | 0.429 |
| 12632.29991 | 0.429 |
| 12642.5014 | 0.428 |
| 12652.69895 | 0.428 |
| 12662.25557 | 0.428 |
| 12672.44547 | 0.428 |
| 12682.63142 | 0.428 |
| 12692.17715 | 0.428 |
| 12702.35544 | 0.428 |
| 12712.52975 | 0.428 |
| 12722.06458 | 0.428 |
| 12732.23121 | 0.428 |
| 12742.39387 | 0.428 |
| 12752.55256 | 0.428 |
| 12762.07271 | 0.428 |
| 12772.22369 | 0.428 |
| 12782.37068 | 0.428 |
| 12792.51369 | 0.427 |
| 12802.01913 | 0.427 |
| 12812.1544 | 0.427 |
| 12822.28568 | 0.427 |
| 12832.41295 | 0.427 |
| 12842.53622 | 0.427 |
| 12852.02315 | 0.427 |
| 12862.13866 | 0.427 |
| 12872.25016 | 0.427 |
| 12882.35764 | 0.427 |
| 12892.4611 | 0.427 |
| 12901.92944 | 0.427 |
| 12912.02511 | 0.427 |
| 12922.11675 | 0.427 |
| 12932.20436 | 0.427 |
| 12942.28794 | 0.427 |
| 12952.36747 | 0.427 |
| 12962.44297 | 0.426 |
| 12971.88508 | 0.426 |
| 12981.95274 | 0.426 |
| 12992.01635 | 0.426 |
| 13002.07591 | 0.426 |
| 13012.13141 | 0.426 |
| 13022.18286 | 0.426 |
| 13032.23024 | 0.426 |
| 13042.27356 | 0.426 |
| 13052.31281 | 0.426 |
| 13062.34799 | 0.426 |
| 13072.37909 | 0.426 |
| 13081.77955 | 0.426 |
| 13091.80275 | 0.426 |
| 13101.82186 | 0.426 |
| 13111.83689 | 0.426 |
| 13121.84783 | 0.426 |
| 13131.85468 | 0.426 |
| 13141.85743 | 0.426 |
| 13151.85608 | 0.425 |
| 13161.85063 | 0.425 |
| 13171.84107 | 0.425 |
| 13181.8274 | 0.425 |
| 13191.80963 | 0.425 |
| 13201.78774 | 0.425 |
| 13211.76172 | 0.425 |
| 13221.73159 | 0.425 |
| 13231.69734 | 0.425 |
| 13241.65895 | 0.425 |
| 13252.23865 | 0.425 |
| 13262.19174 | 0.425 |
| 13272.1407 | 0.425 |
| 13282.08552 | 0.425 |
| 13292.02619 | 0.425 |
| 13301.96272 | 0.425 |
| 13311.8951 | 0.425 |
| 13321.82333 | 0.425 |
| 13331.7474 | 0.425 |
| 13341.66731 | 0.425 |
| 13351.58306 | 0.425 |
| 13362.11398 | 0.425 |
| 13372.02114 | 0.424 |
| 13381.92413 | 0.424 |
| 13391.82294 | 0.424 |
| 13401.71758 | 0.424 |
| 13411.60803 | 0.424 |
| 13422.11206 | 0.424 |
| 13431.99388 | 0.424 |
| 13441.87151 | 0.424 |
| 13451.74495 | 0.424 |
| 13461.6142 | 0.424 |
| 13472.09567 | 0.424 |
| 13481.95625 | 0.424 |
| 13491.81263 | 0.424 |
| 13501.66479 | 0.424 |
| 13511.51275 | 0.424 |
| 13521.97158 | 0.424 |
| 13531.81084 | 0.424 |
| 13541.64588 | 0.424 |
| 13551.47669 | 0.424 |
| 13561.9173 | 0.424 |
| 13571.7394 | 0.424 |
| 13581.55725 | 0.424 |
| 13591.98409 | 0.424 |
| 13601.79321 | 0.424 |
| 13611.59808 | 0.424 |
| 13621.39871 | 0.424 |
| 13631.80722 | 0.423 |
| 13641.59909 | 0.423 |
| 13651.38669 | 0.423 |
| 13661.78136 | 0.423 |
| 13671.56018 | 0.423 |
| 13681.94551 | 0.423 |
| 13691.71553 | 0.423 |
| 13701.48128 | 0.423 |
| 13711.85271 | 0.423 |
| 13721.60964 | 0.423 |
| 13731.3623 | 0.423 |
| 13741.7198 | 0.423 |
| 13751.46361 | 0.423 |
| 13761.81172 | 0.423 |
| 13771.54668 | 0.423 |
| 13781.88538 | 0.423 |
| 13791.61148 | 0.423 |
| 13801.33328 | 0.423 |
| 13811.65798 | 0.423 |
| 13821.37089 | 0.423 |
| 13831.68615 | 0.423 |
| 13841.39017 | 0.423 |
| 13851.69596 | 0.423 |
| 13861.39108 | 0.423 |
| 13871.6874 | 0.423 |
| 13881.37359 | 0.423 |
| 13891.66043 | 0.423 |
| 13901.33769 | 0.423 |
| 13911.61502 | 0.423 |
| 13921.28334 | 0.423 |
| 13931.55116 | 0.423 |
| 13941.21051 | 0.423 |
| 13951.46881 | 0.423 |
| 13961.72219 | 0.423 |
| 13971.36795 | 0.423 |
| 13981.61179 | 0.423 |
| 13991.24855 | 0.423 |
| 14001.48283 | 0.423 |
| 14011.71217 | 0.423 |
| 14021.33529 | 0.423 |
| 14031.55505 | 0.423 |
| 14041.16914 | 0.423 |
| 14051.37931 | 0.423 |
| 14061.58453 | 0.423 |
| 14071.18493 | 0.423 |
| 14081.38053 | 0.423 |
| 14091.57118 | 0.423 |
| 14101.15785 | 0.423 |
| 14111.33886 | 0.423 |
| 14121.51491 | 0.423 |
| 14131.08782 | 0.423 |
| 14141.25421 | 0.423 |
| 14151.41561 | 0.423 |
| 14161.57204 | 0.423 |
| 14171.12647 | 0.423 |
| 14181.27321 | 0.423 |
| 14191.41496 | 0.423 |
| 14201.55171 | 0.423 |
| 14211.08762 | 0.423 |
| 14221.21466 | 0.423 |
| 14231.33669 | 0.423 |
| 14241.45371 | 0.423 |
| 14250.97103 | 0.423 |
| 14261.07831 | 0.423 |
| 14271.18057 | 0.423 |
| 14281.27781 | 0.423 |
| 14291.37001 | 0.423 |
| 14301.45718 | 0.423 |
| 14310.94639 | 0.423 |
| 14321.02379 | 0.423 |
| 14331.09614 | 0.423 |
| 14341.16344 | 0.423 |
| 14351.2257 | 0.423 |
| 14361.2829 | 0.423 |
| 14371.33504 | 0.423 |
| 14381.38213 | 0.423 |
| 14391.42415 | 0.423 |
| 14400.87083 | 0.423 |
| 14410.90301 | 0.423 |
| 14420.93011 | 0.423 |
| 14430.95214 | 0.423 |
| 14440.96908 | 0.423 |
| 14450.98094 | 0.423 |
| 14460.98771 | 0.423 |
| 14470.98939 | 0.423 |
| 14480.98597 | 0.423 |
| 14490.97745 | 0.423 |
| 14500.96383 | 0.423 |
| 14510.9451 | 0.423 |
| 14520.92127 | 0.423 |
| 14530.89232 | 0.423 |
| 14540.85825 | 0.423 |
| 14550.81906 | 0.423 |
| 14560.77475 | 0.423 |
| 14571.31048 | 0.423 |
| 14581.25561 | 0.423 |
| 14591.19561 | 0.423 |
| 14601.13046 | 0.423 |
| 14611.06018 | 0.423 |
| 14620.98475 | 0.423 |
| 14630.90417 | 0.423 |
| 14640.81844 | 0.423 |
| 14650.72755 | 0.423 |
| 14661.21393 | 0.424 |
| 14671.11242 | 0.424 |
| 14681.00574 | 0.424 |
| 14690.89389 | 0.424 |
| 14700.77687 | 0.424 |
| 14710.65467 | 0.424 |
| 14721.10787 | 0.424 |
| 14730.975 | 0.424 |
| 14740.83695 | 0.424 |
| 14750.6937 | 0.424 |
| 14761.12461 | 0.424 |
| 14770.97066 | 0.424 |
| 14780.81152 | 0.424 |
| 14790.64717 | 0.424 |
| 14801.05571 | 0.424 |
| 14810.88064 | 0.424 |
| 14820.70034 | 0.424 |
| 14831.09199 | 0.424 |
| 14840.90095 | 0.425 |
| 14850.70469 | 0.425 |
| 14861.07941 | 0.425 |
| 14870.87237 | 0.425 |
| 14880.6601 | 0.425 |
| 14891.01786 | 0.425 |
| 14900.7948 | 0.425 |
| 14910.56649 | 0.425 |
| 14920.90726 | 0.425 |
| 14930.66813 | 0.425 |
| 14940.99744 | 0.425 |
| 14950.74749 | 0.425 |
| 14960.49227 | 0.425 |
| 14970.80453 | 0.425 |
| 14980.53846 | 0.426 |
| 14990.83922 | 0.426 |
| 15000.56229 | 0.426 |
| 15010.85154 | 0.426 |
| 15020.56373 | 0.426 |
| 15030.84146 | 0.426 |
| 15040.54275 | 0.426 |
| 15050.80894 | 0.426 |
| 15060.49932 | 0.426 |
| 15070.75395 | 0.426 |
| 15080.43342 | 0.426 |
| 15090.67647 | 0.426 |
| 15100.91357 | 0.427 |
| 15110.57647 | 0.427 |
| 15120.80197 | 0.427 |
| 15130.45391 | 0.427 |
| 15140.6678 | 0.427 |
| 15150.87571 | 0.427 |
| 15160.51103 | 0.427 |
| 15170.70731 | 0.427 |
| 15180.33163 | 0.427 |
| 15190.51626 | 0.428 |
| 15200.69489 | 0.428 |
| 15210.30253 | 0.428 |
| 15220.4695 | 0.428 |
| 15230.63045 | 0.428 |
| 15240.78539 | 0.428 |
| 15250.37064 | 0.428 |
| 15260.51388 | 0.428 |
| 15270.65109 | 0.429 |
| 15280.78227 | 0.429 |
| 15290.34507 | 0.429 |
| 15300.46452 | 0.429 |
| 15310.57793 | 0.429 |
| 15320.6853 | 0.429 |
| 15330.22559 | 0.429 |
| 15340.32119 | 0.429 |
| 15350.41073 | 0.43 |
| 15360.49422 | 0.43 |
| 15370.57164 | 0.43 |
| 15380.64299 | 0.43 |
| 15390.70827 | 0.43 |
| 15400.20879 | 0.43 |
| 15410.26225 | 0.43 |
| 15420.30963 | 0.431 |
| 15430.35092 | 0.431 |
| 15440.38612 | 0.431 |
| 15450.41522 | 0.431 |
| 15460.43823 | 0.431 |
| 15470.45513 | 0.431 |
| 15480.46592 | 0.431 |
| 15490.4706 | 0.432 |
| 15500.46917 | 0.432 |
| 15510.46161 | 0.432 |
| 15520.44794 | 0.432 |
| 15530.42813 | 0.432 |
| 15540.4022 | 0.432 |
| 15550.37013 | 0.433 |
| 15560.33192 | 0.433 |
| 15570.28757 | 0.433 |
| 15580.23707 | 0.433 |
| 15590.18042 | 0.433 |
| 15600.11761 | 0.433 |
| 15610.04865 | 0.433 |
| 15620.52472 | 0.434 |
| 15630.44309 | 0.434 |
| 15640.35528 | 0.434 |
| 15650.2613 | 0.434 |
| 15660.16114 | 0.434 |
| 15670.0548 | 0.434 |
| 15680.4914 | 0.435 |
| 15690.37234 | 0.435 |
| 15700.24708 | 0.435 |
| 15710.11563 | 0.435 |
| 15719.97797 | 0.435 |
| 15730.38149 | 0.436 |
| 15740.23107 | 0.436 |
| 15750.07444 | 0.436 |
| 15759.91159 | 0.436 |
| 15770.2885 | 0.436 |
| 15780.11286 | 0.436 |
| 15789.93098 | 0.437 |
| 15800.2878 | 0.437 |
| 15810.09311 | 0.437 |
| 15819.89218 | 0.437 |
| 15830.22886 | 0.437 |
| 15840.01509 | 0.437 |
| 15850.33821 | 0.438 |
| 15860.11158 | 0.438 |
| 15869.87869 | 0.438 |
| 15880.18161 | 0.438 |
| 15889.93584 | 0.438 |
| 15900.22516 | 0.439 |
| 15909.96648 | 0.439 |
| 15920.24218 | 0.439 |
| 15929.97059 | 0.439 |
| 15940.23264 | 0.439 |
| 15949.94812 | 0.439 |
| 15960.19652 | 0.44 |
| 15969.89905 | 0.44 |
| 15980.13377 | 0.44 |
| 15989.82334 | 0.44 |
| 16000.04436 | 0.44 |